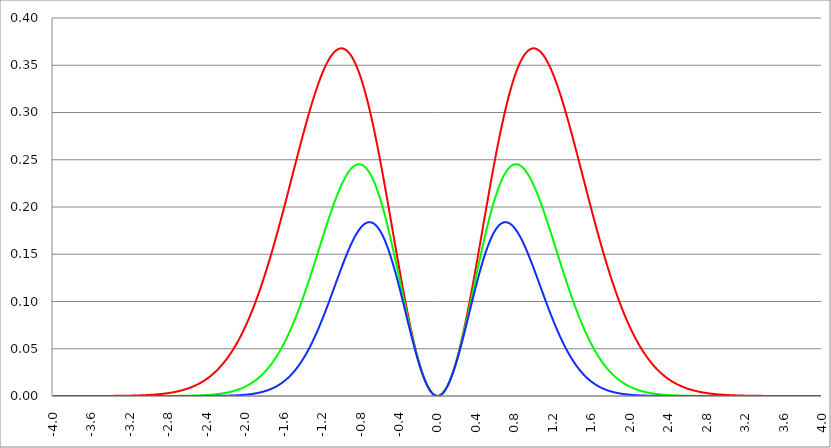
| Category | Series 1 | Series 0 | Series 2 |
|---|---|---|---|
| -4.0 | 0 | 0 | 0 |
| -3.996 | 0 | 0 | 0 |
| -3.992 | 0 | 0 | 0 |
| -3.988 | 0 | 0 | 0 |
| -3.984 | 0 | 0 | 0 |
| -3.98 | 0 | 0 | 0 |
| -3.976 | 0 | 0 | 0 |
| -3.972 | 0 | 0 | 0 |
| -3.968 | 0 | 0 | 0 |
| -3.964 | 0 | 0 | 0 |
| -3.96 | 0 | 0 | 0 |
| -3.956 | 0 | 0 | 0 |
| -3.952 | 0 | 0 | 0 |
| -3.948 | 0 | 0 | 0 |
| -3.944 | 0 | 0 | 0 |
| -3.94 | 0 | 0 | 0 |
| -3.936 | 0 | 0 | 0 |
| -3.932 | 0 | 0 | 0 |
| -3.928 | 0 | 0 | 0 |
| -3.924 | 0 | 0 | 0 |
| -3.92 | 0 | 0 | 0 |
| -3.916 | 0 | 0 | 0 |
| -3.912 | 0 | 0 | 0 |
| -3.908 | 0 | 0 | 0 |
| -3.904 | 0 | 0 | 0 |
| -3.9 | 0 | 0 | 0 |
| -3.896 | 0 | 0 | 0 |
| -3.892 | 0 | 0 | 0 |
| -3.888 | 0 | 0 | 0 |
| -3.884 | 0 | 0 | 0 |
| -3.88 | 0 | 0 | 0 |
| -3.876 | 0 | 0 | 0 |
| -3.872 | 0 | 0 | 0 |
| -3.868 | 0 | 0 | 0 |
| -3.864 | 0 | 0 | 0 |
| -3.86 | 0 | 0 | 0 |
| -3.856 | 0 | 0 | 0 |
| -3.852 | 0 | 0 | 0 |
| -3.848 | 0 | 0 | 0 |
| -3.844 | 0 | 0 | 0 |
| -3.84 | 0 | 0 | 0 |
| -3.836 | 0 | 0 | 0 |
| -3.832 | 0 | 0 | 0 |
| -3.828 | 0 | 0 | 0 |
| -3.824 | 0 | 0 | 0 |
| -3.82 | 0 | 0 | 0 |
| -3.816 | 0 | 0 | 0 |
| -3.812 | 0 | 0 | 0 |
| -3.808 | 0 | 0 | 0 |
| -3.804 | 0 | 0 | 0 |
| -3.8 | 0 | 0 | 0 |
| -3.796 | 0 | 0 | 0 |
| -3.792 | 0 | 0 | 0 |
| -3.788 | 0 | 0 | 0 |
| -3.784 | 0 | 0 | 0 |
| -3.78 | 0 | 0 | 0 |
| -3.776 | 0 | 0 | 0 |
| -3.772 | 0 | 0 | 0 |
| -3.768 | 0 | 0 | 0 |
| -3.764 | 0 | 0 | 0 |
| -3.76 | 0 | 0 | 0 |
| -3.756 | 0 | 0 | 0 |
| -3.752 | 0 | 0 | 0 |
| -3.748 | 0 | 0 | 0 |
| -3.744 | 0 | 0 | 0 |
| -3.74 | 0 | 0 | 0 |
| -3.736 | 0 | 0 | 0 |
| -3.732 | 0 | 0 | 0 |
| -3.728 | 0 | 0 | 0 |
| -3.724 | 0 | 0 | 0 |
| -3.72 | 0 | 0 | 0 |
| -3.716 | 0 | 0 | 0 |
| -3.712 | 0 | 0 | 0 |
| -3.708 | 0 | 0 | 0 |
| -3.704 | 0 | 0 | 0 |
| -3.7 | 0 | 0 | 0 |
| -3.696 | 0 | 0 | 0 |
| -3.692 | 0 | 0 | 0 |
| -3.688 | 0 | 0 | 0 |
| -3.684 | 0 | 0 | 0 |
| -3.68 | 0 | 0 | 0 |
| -3.676 | 0 | 0 | 0 |
| -3.672 | 0 | 0 | 0 |
| -3.668 | 0 | 0 | 0 |
| -3.664 | 0 | 0 | 0 |
| -3.66 | 0 | 0 | 0 |
| -3.656 | 0 | 0 | 0 |
| -3.652 | 0 | 0 | 0 |
| -3.648 | 0 | 0 | 0 |
| -3.644 | 0 | 0 | 0 |
| -3.64 | 0 | 0 | 0 |
| -3.636 | 0 | 0 | 0 |
| -3.632 | 0 | 0 | 0 |
| -3.628 | 0 | 0 | 0 |
| -3.624 | 0 | 0 | 0 |
| -3.62 | 0 | 0 | 0 |
| -3.616 | 0 | 0 | 0 |
| -3.612 | 0 | 0 | 0 |
| -3.608 | 0 | 0 | 0 |
| -3.604 | 0 | 0 | 0 |
| -3.6 | 0 | 0 | 0 |
| -3.596 | 0 | 0 | 0 |
| -3.592 | 0 | 0 | 0 |
| -3.588 | 0 | 0 | 0 |
| -3.584 | 0 | 0 | 0 |
| -3.58 | 0 | 0 | 0 |
| -3.576 | 0 | 0 | 0 |
| -3.572 | 0 | 0 | 0 |
| -3.568 | 0 | 0 | 0 |
| -3.564 | 0 | 0 | 0 |
| -3.56 | 0 | 0 | 0 |
| -3.556 | 0 | 0 | 0 |
| -3.552 | 0 | 0 | 0 |
| -3.548 | 0 | 0 | 0 |
| -3.544 | 0 | 0 | 0 |
| -3.54 | 0 | 0 | 0 |
| -3.536 | 0 | 0 | 0 |
| -3.532 | 0 | 0 | 0 |
| -3.528 | 0 | 0 | 0 |
| -3.524 | 0 | 0 | 0 |
| -3.52 | 0 | 0 | 0 |
| -3.516 | 0 | 0 | 0 |
| -3.512 | 0 | 0 | 0 |
| -3.508 | 0 | 0 | 0 |
| -3.504 | 0 | 0 | 0 |
| -3.5 | 0 | 0 | 0 |
| -3.496 | 0 | 0 | 0 |
| -3.492 | 0 | 0 | 0 |
| -3.488 | 0 | 0 | 0 |
| -3.484 | 0 | 0 | 0 |
| -3.48 | 0 | 0 | 0 |
| -3.476 | 0 | 0 | 0 |
| -3.472 | 0 | 0 | 0 |
| -3.467999999999999 | 0 | 0 | 0 |
| -3.463999999999999 | 0 | 0 | 0 |
| -3.459999999999999 | 0 | 0 | 0 |
| -3.455999999999999 | 0 | 0 | 0 |
| -3.451999999999999 | 0 | 0 | 0 |
| -3.447999999999999 | 0 | 0 | 0 |
| -3.443999999999999 | 0 | 0 | 0 |
| -3.439999999999999 | 0 | 0 | 0 |
| -3.435999999999999 | 0 | 0 | 0 |
| -3.431999999999999 | 0 | 0 | 0 |
| -3.427999999999999 | 0 | 0 | 0 |
| -3.423999999999999 | 0 | 0 | 0 |
| -3.419999999999999 | 0 | 0 | 0 |
| -3.415999999999999 | 0 | 0 | 0 |
| -3.411999999999999 | 0 | 0 | 0 |
| -3.407999999999999 | 0 | 0 | 0 |
| -3.403999999999999 | 0 | 0 | 0 |
| -3.399999999999999 | 0 | 0 | 0 |
| -3.395999999999999 | 0 | 0 | 0 |
| -3.391999999999999 | 0 | 0 | 0 |
| -3.387999999999999 | 0 | 0 | 0 |
| -3.383999999999999 | 0 | 0 | 0 |
| -3.379999999999999 | 0 | 0 | 0 |
| -3.375999999999999 | 0 | 0 | 0 |
| -3.371999999999999 | 0 | 0 | 0 |
| -3.367999999999999 | 0 | 0 | 0 |
| -3.363999999999999 | 0 | 0 | 0 |
| -3.359999999999999 | 0 | 0 | 0 |
| -3.355999999999999 | 0 | 0 | 0 |
| -3.351999999999999 | 0 | 0 | 0 |
| -3.347999999999999 | 0 | 0 | 0 |
| -3.343999999999999 | 0 | 0 | 0 |
| -3.339999999999999 | 0 | 0 | 0 |
| -3.335999999999999 | 0 | 0 | 0 |
| -3.331999999999999 | 0 | 0 | 0 |
| -3.327999999999999 | 0 | 0 | 0 |
| -3.323999999999999 | 0 | 0 | 0 |
| -3.319999999999999 | 0 | 0 | 0 |
| -3.315999999999999 | 0 | 0 | 0 |
| -3.311999999999999 | 0 | 0 | 0 |
| -3.307999999999999 | 0 | 0 | 0 |
| -3.303999999999999 | 0 | 0 | 0 |
| -3.299999999999999 | 0 | 0 | 0 |
| -3.295999999999999 | 0 | 0 | 0 |
| -3.291999999999999 | 0 | 0 | 0 |
| -3.288 | 0 | 0 | 0 |
| -3.284 | 0 | 0 | 0 |
| -3.279999999999999 | 0 | 0 | 0 |
| -3.275999999999999 | 0 | 0 | 0 |
| -3.271999999999999 | 0 | 0 | 0 |
| -3.268 | 0 | 0 | 0 |
| -3.264 | 0 | 0 | 0 |
| -3.259999999999999 | 0 | 0 | 0 |
| -3.255999999999999 | 0 | 0 | 0 |
| -3.251999999999999 | 0 | 0 | 0 |
| -3.248 | 0 | 0 | 0 |
| -3.244 | 0 | 0 | 0 |
| -3.239999999999999 | 0 | 0 | 0 |
| -3.235999999999999 | 0 | 0 | 0 |
| -3.231999999999999 | 0 | 0 | 0 |
| -3.228 | 0 | 0 | 0 |
| -3.224 | 0 | 0 | 0 |
| -3.219999999999999 | 0 | 0 | 0 |
| -3.215999999999999 | 0 | 0 | 0 |
| -3.211999999999999 | 0 | 0 | 0 |
| -3.208 | 0 | 0 | 0 |
| -3.204 | 0 | 0 | 0 |
| -3.199999999999999 | 0 | 0 | 0 |
| -3.195999999999999 | 0 | 0 | 0 |
| -3.191999999999999 | 0 | 0 | 0 |
| -3.188 | 0 | 0 | 0 |
| -3.184 | 0 | 0 | 0 |
| -3.179999999999999 | 0 | 0 | 0 |
| -3.175999999999999 | 0 | 0 | 0 |
| -3.171999999999999 | 0 | 0 | 0 |
| -3.168 | 0 | 0 | 0 |
| -3.164 | 0 | 0 | 0 |
| -3.159999999999999 | 0 | 0 | 0 |
| -3.155999999999999 | 0 | 0 | 0 |
| -3.151999999999999 | 0 | 0 | 0 |
| -3.148 | 0 | 0 | 0 |
| -3.144 | 0.001 | 0 | 0 |
| -3.139999999999999 | 0.001 | 0 | 0 |
| -3.135999999999999 | 0.001 | 0 | 0 |
| -3.131999999999999 | 0.001 | 0 | 0 |
| -3.128 | 0.001 | 0 | 0 |
| -3.124 | 0.001 | 0 | 0 |
| -3.119999999999999 | 0.001 | 0 | 0 |
| -3.115999999999999 | 0.001 | 0 | 0 |
| -3.111999999999999 | 0.001 | 0 | 0 |
| -3.108 | 0.001 | 0 | 0 |
| -3.104 | 0.001 | 0 | 0 |
| -3.099999999999999 | 0.001 | 0 | 0 |
| -3.095999999999999 | 0.001 | 0 | 0 |
| -3.091999999999999 | 0.001 | 0 | 0 |
| -3.088 | 0.001 | 0 | 0 |
| -3.084 | 0.001 | 0 | 0 |
| -3.079999999999999 | 0.001 | 0 | 0 |
| -3.075999999999999 | 0.001 | 0 | 0 |
| -3.071999999999999 | 0.001 | 0 | 0 |
| -3.068 | 0.001 | 0 | 0 |
| -3.064 | 0.001 | 0 | 0 |
| -3.059999999999999 | 0.001 | 0 | 0 |
| -3.055999999999999 | 0.001 | 0 | 0 |
| -3.051999999999999 | 0.001 | 0 | 0 |
| -3.048 | 0.001 | 0 | 0 |
| -3.044 | 0.001 | 0 | 0 |
| -3.039999999999999 | 0.001 | 0 | 0 |
| -3.035999999999999 | 0.001 | 0 | 0 |
| -3.031999999999999 | 0.001 | 0 | 0 |
| -3.028 | 0.001 | 0 | 0 |
| -3.024 | 0.001 | 0 | 0 |
| -3.019999999999999 | 0.001 | 0 | 0 |
| -3.015999999999999 | 0.001 | 0 | 0 |
| -3.011999999999999 | 0.001 | 0 | 0 |
| -3.008 | 0.001 | 0 | 0 |
| -3.004 | 0.001 | 0 | 0 |
| -2.999999999999999 | 0.001 | 0 | 0 |
| -2.995999999999999 | 0.001 | 0 | 0 |
| -2.991999999999999 | 0.001 | 0 | 0 |
| -2.988 | 0.001 | 0 | 0 |
| -2.984 | 0.001 | 0 | 0 |
| -2.979999999999999 | 0.001 | 0 | 0 |
| -2.975999999999999 | 0.001 | 0 | 0 |
| -2.971999999999999 | 0.001 | 0 | 0 |
| -2.968 | 0.001 | 0 | 0 |
| -2.964 | 0.001 | 0 | 0 |
| -2.959999999999999 | 0.001 | 0 | 0 |
| -2.955999999999999 | 0.001 | 0 | 0 |
| -2.951999999999999 | 0.001 | 0 | 0 |
| -2.948 | 0.001 | 0 | 0 |
| -2.944 | 0.001 | 0 | 0 |
| -2.939999999999999 | 0.002 | 0 | 0 |
| -2.935999999999999 | 0.002 | 0 | 0 |
| -2.931999999999999 | 0.002 | 0 | 0 |
| -2.928 | 0.002 | 0 | 0 |
| -2.924 | 0.002 | 0 | 0 |
| -2.919999999999999 | 0.002 | 0 | 0 |
| -2.915999999999999 | 0.002 | 0 | 0 |
| -2.911999999999999 | 0.002 | 0 | 0 |
| -2.908 | 0.002 | 0 | 0 |
| -2.904 | 0.002 | 0 | 0 |
| -2.899999999999999 | 0.002 | 0 | 0 |
| -2.895999999999999 | 0.002 | 0 | 0 |
| -2.891999999999999 | 0.002 | 0 | 0 |
| -2.887999999999999 | 0.002 | 0 | 0 |
| -2.883999999999999 | 0.002 | 0 | 0 |
| -2.879999999999999 | 0.002 | 0 | 0 |
| -2.875999999999999 | 0.002 | 0 | 0 |
| -2.871999999999999 | 0.002 | 0 | 0 |
| -2.867999999999999 | 0.002 | 0 | 0 |
| -2.863999999999999 | 0.002 | 0 | 0 |
| -2.859999999999999 | 0.002 | 0 | 0 |
| -2.855999999999999 | 0.002 | 0 | 0 |
| -2.851999999999999 | 0.002 | 0 | 0 |
| -2.847999999999999 | 0.002 | 0 | 0 |
| -2.843999999999999 | 0.002 | 0 | 0 |
| -2.839999999999999 | 0.003 | 0 | 0 |
| -2.835999999999999 | 0.003 | 0 | 0 |
| -2.831999999999999 | 0.003 | 0 | 0 |
| -2.827999999999999 | 0.003 | 0 | 0 |
| -2.823999999999999 | 0.003 | 0 | 0 |
| -2.819999999999999 | 0.003 | 0 | 0 |
| -2.815999999999999 | 0.003 | 0 | 0 |
| -2.811999999999999 | 0.003 | 0 | 0 |
| -2.807999999999999 | 0.003 | 0 | 0 |
| -2.803999999999999 | 0.003 | 0 | 0 |
| -2.799999999999999 | 0.003 | 0 | 0 |
| -2.795999999999999 | 0.003 | 0 | 0 |
| -2.791999999999999 | 0.003 | 0 | 0 |
| -2.787999999999999 | 0.003 | 0 | 0 |
| -2.783999999999999 | 0.003 | 0 | 0 |
| -2.779999999999999 | 0.003 | 0 | 0 |
| -2.775999999999999 | 0.003 | 0 | 0 |
| -2.771999999999999 | 0.004 | 0 | 0 |
| -2.767999999999999 | 0.004 | 0 | 0 |
| -2.763999999999999 | 0.004 | 0 | 0 |
| -2.759999999999999 | 0.004 | 0 | 0 |
| -2.755999999999999 | 0.004 | 0 | 0 |
| -2.751999999999999 | 0.004 | 0 | 0 |
| -2.747999999999999 | 0.004 | 0 | 0 |
| -2.743999999999999 | 0.004 | 0 | 0 |
| -2.739999999999999 | 0.004 | 0 | 0 |
| -2.735999999999999 | 0.004 | 0 | 0 |
| -2.731999999999999 | 0.004 | 0 | 0 |
| -2.727999999999999 | 0.004 | 0 | 0 |
| -2.723999999999999 | 0.004 | 0 | 0 |
| -2.719999999999999 | 0.005 | 0 | 0 |
| -2.715999999999999 | 0.005 | 0 | 0 |
| -2.711999999999999 | 0.005 | 0 | 0 |
| -2.707999999999999 | 0.005 | 0 | 0 |
| -2.703999999999999 | 0.005 | 0 | 0 |
| -2.699999999999999 | 0.005 | 0 | 0 |
| -2.695999999999999 | 0.005 | 0 | 0 |
| -2.691999999999999 | 0.005 | 0 | 0 |
| -2.687999999999999 | 0.005 | 0 | 0 |
| -2.683999999999999 | 0.005 | 0 | 0 |
| -2.679999999999999 | 0.005 | 0 | 0 |
| -2.675999999999999 | 0.006 | 0 | 0 |
| -2.671999999999999 | 0.006 | 0 | 0 |
| -2.667999999999999 | 0.006 | 0 | 0 |
| -2.663999999999999 | 0.006 | 0 | 0 |
| -2.659999999999999 | 0.006 | 0 | 0 |
| -2.655999999999999 | 0.006 | 0 | 0 |
| -2.651999999999999 | 0.006 | 0 | 0 |
| -2.647999999999999 | 0.006 | 0 | 0 |
| -2.643999999999999 | 0.006 | 0 | 0 |
| -2.639999999999999 | 0.007 | 0 | 0 |
| -2.635999999999999 | 0.007 | 0 | 0 |
| -2.631999999999999 | 0.007 | 0 | 0 |
| -2.627999999999999 | 0.007 | 0 | 0 |
| -2.623999999999999 | 0.007 | 0 | 0 |
| -2.619999999999999 | 0.007 | 0 | 0 |
| -2.615999999999999 | 0.007 | 0 | 0 |
| -2.611999999999999 | 0.007 | 0 | 0 |
| -2.607999999999999 | 0.008 | 0 | 0 |
| -2.603999999999999 | 0.008 | 0 | 0 |
| -2.599999999999999 | 0.008 | 0 | 0 |
| -2.595999999999999 | 0.008 | 0 | 0 |
| -2.591999999999999 | 0.008 | 0 | 0 |
| -2.587999999999999 | 0.008 | 0 | 0 |
| -2.583999999999999 | 0.008 | 0 | 0 |
| -2.579999999999999 | 0.009 | 0 | 0 |
| -2.575999999999999 | 0.009 | 0 | 0 |
| -2.571999999999999 | 0.009 | 0 | 0 |
| -2.567999999999999 | 0.009 | 0 | 0 |
| -2.563999999999999 | 0.009 | 0 | 0 |
| -2.559999999999999 | 0.009 | 0 | 0 |
| -2.555999999999999 | 0.01 | 0 | 0 |
| -2.551999999999999 | 0.01 | 0 | 0 |
| -2.547999999999999 | 0.01 | 0 | 0 |
| -2.543999999999999 | 0.01 | 0 | 0 |
| -2.539999999999999 | 0.01 | 0 | 0 |
| -2.535999999999999 | 0.01 | 0 | 0 |
| -2.531999999999999 | 0.011 | 0 | 0 |
| -2.527999999999999 | 0.011 | 0 | 0 |
| -2.523999999999999 | 0.011 | 0 | 0 |
| -2.519999999999999 | 0.011 | 0 | 0 |
| -2.515999999999999 | 0.011 | 0 | 0 |
| -2.511999999999999 | 0.011 | 0 | 0 |
| -2.507999999999999 | 0.012 | 0.001 | 0 |
| -2.503999999999999 | 0.012 | 0.001 | 0 |
| -2.499999999999999 | 0.012 | 0.001 | 0 |
| -2.495999999999999 | 0.012 | 0.001 | 0 |
| -2.491999999999999 | 0.012 | 0.001 | 0 |
| -2.487999999999999 | 0.013 | 0.001 | 0 |
| -2.483999999999999 | 0.013 | 0.001 | 0 |
| -2.479999999999999 | 0.013 | 0.001 | 0 |
| -2.475999999999999 | 0.013 | 0.001 | 0 |
| -2.471999999999999 | 0.014 | 0.001 | 0 |
| -2.467999999999999 | 0.014 | 0.001 | 0 |
| -2.463999999999999 | 0.014 | 0.001 | 0 |
| -2.459999999999999 | 0.014 | 0.001 | 0 |
| -2.455999999999999 | 0.014 | 0.001 | 0 |
| -2.451999999999999 | 0.015 | 0.001 | 0 |
| -2.447999999999999 | 0.015 | 0.001 | 0 |
| -2.443999999999999 | 0.015 | 0.001 | 0 |
| -2.439999999999999 | 0.015 | 0.001 | 0 |
| -2.435999999999999 | 0.016 | 0.001 | 0 |
| -2.431999999999999 | 0.016 | 0.001 | 0 |
| -2.427999999999999 | 0.016 | 0.001 | 0 |
| -2.423999999999999 | 0.016 | 0.001 | 0 |
| -2.419999999999999 | 0.017 | 0.001 | 0 |
| -2.415999999999999 | 0.017 | 0.001 | 0 |
| -2.411999999999999 | 0.017 | 0.001 | 0 |
| -2.407999999999999 | 0.018 | 0.001 | 0 |
| -2.403999999999999 | 0.018 | 0.001 | 0 |
| -2.399999999999999 | 0.018 | 0.001 | 0 |
| -2.395999999999999 | 0.018 | 0.001 | 0 |
| -2.391999999999999 | 0.019 | 0.001 | 0 |
| -2.387999999999999 | 0.019 | 0.001 | 0 |
| -2.383999999999999 | 0.019 | 0.001 | 0 |
| -2.379999999999999 | 0.02 | 0.001 | 0 |
| -2.375999999999999 | 0.02 | 0.001 | 0 |
| -2.371999999999999 | 0.02 | 0.001 | 0 |
| -2.367999999999998 | 0.021 | 0.001 | 0 |
| -2.363999999999998 | 0.021 | 0.001 | 0 |
| -2.359999999999998 | 0.021 | 0.001 | 0 |
| -2.355999999999998 | 0.022 | 0.001 | 0 |
| -2.351999999999998 | 0.022 | 0.001 | 0 |
| -2.347999999999998 | 0.022 | 0.001 | 0 |
| -2.343999999999998 | 0.023 | 0.001 | 0 |
| -2.339999999999998 | 0.023 | 0.001 | 0 |
| -2.335999999999998 | 0.023 | 0.002 | 0 |
| -2.331999999999998 | 0.024 | 0.002 | 0 |
| -2.327999999999998 | 0.024 | 0.002 | 0 |
| -2.323999999999998 | 0.024 | 0.002 | 0 |
| -2.319999999999998 | 0.025 | 0.002 | 0 |
| -2.315999999999998 | 0.025 | 0.002 | 0 |
| -2.311999999999998 | 0.025 | 0.002 | 0 |
| -2.307999999999998 | 0.026 | 0.002 | 0 |
| -2.303999999999998 | 0.026 | 0.002 | 0 |
| -2.299999999999998 | 0.027 | 0.002 | 0 |
| -2.295999999999998 | 0.027 | 0.002 | 0 |
| -2.291999999999998 | 0.027 | 0.002 | 0 |
| -2.287999999999998 | 0.028 | 0.002 | 0 |
| -2.283999999999998 | 0.028 | 0.002 | 0 |
| -2.279999999999998 | 0.029 | 0.002 | 0 |
| -2.275999999999998 | 0.029 | 0.002 | 0 |
| -2.271999999999998 | 0.03 | 0.002 | 0 |
| -2.267999999999998 | 0.03 | 0.002 | 0 |
| -2.263999999999998 | 0.03 | 0.002 | 0 |
| -2.259999999999998 | 0.031 | 0.002 | 0 |
| -2.255999999999998 | 0.031 | 0.002 | 0 |
| -2.251999999999998 | 0.032 | 0.003 | 0 |
| -2.247999999999998 | 0.032 | 0.003 | 0 |
| -2.243999999999998 | 0.033 | 0.003 | 0 |
| -2.239999999999998 | 0.033 | 0.003 | 0 |
| -2.235999999999998 | 0.034 | 0.003 | 0 |
| -2.231999999999998 | 0.034 | 0.003 | 0 |
| -2.227999999999998 | 0.035 | 0.003 | 0 |
| -2.223999999999998 | 0.035 | 0.003 | 0 |
| -2.219999999999998 | 0.036 | 0.003 | 0 |
| -2.215999999999998 | 0.036 | 0.003 | 0 |
| -2.211999999999998 | 0.037 | 0.003 | 0 |
| -2.207999999999998 | 0.037 | 0.003 | 0 |
| -2.203999999999998 | 0.038 | 0.003 | 0 |
| -2.199999999999998 | 0.038 | 0.003 | 0 |
| -2.195999999999998 | 0.039 | 0.003 | 0 |
| -2.191999999999998 | 0.039 | 0.004 | 0 |
| -2.187999999999998 | 0.04 | 0.004 | 0 |
| -2.183999999999998 | 0.04 | 0.004 | 0 |
| -2.179999999999998 | 0.041 | 0.004 | 0 |
| -2.175999999999998 | 0.042 | 0.004 | 0 |
| -2.171999999999998 | 0.042 | 0.004 | 0 |
| -2.167999999999998 | 0.043 | 0.004 | 0 |
| -2.163999999999998 | 0.043 | 0.004 | 0 |
| -2.159999999999998 | 0.044 | 0.004 | 0 |
| -2.155999999999998 | 0.045 | 0.004 | 0 |
| -2.151999999999998 | 0.045 | 0.004 | 0 |
| -2.147999999999998 | 0.046 | 0.005 | 0 |
| -2.143999999999998 | 0.046 | 0.005 | 0 |
| -2.139999999999998 | 0.047 | 0.005 | 0 |
| -2.135999999999998 | 0.048 | 0.005 | 0 |
| -2.131999999999998 | 0.048 | 0.005 | 0.001 |
| -2.127999999999998 | 0.049 | 0.005 | 0.001 |
| -2.123999999999998 | 0.05 | 0.005 | 0.001 |
| -2.119999999999998 | 0.05 | 0.005 | 0.001 |
| -2.115999999999998 | 0.051 | 0.005 | 0.001 |
| -2.111999999999998 | 0.052 | 0.006 | 0.001 |
| -2.107999999999998 | 0.052 | 0.006 | 0.001 |
| -2.103999999999998 | 0.053 | 0.006 | 0.001 |
| -2.099999999999998 | 0.054 | 0.006 | 0.001 |
| -2.095999999999998 | 0.054 | 0.006 | 0.001 |
| -2.091999999999998 | 0.055 | 0.006 | 0.001 |
| -2.087999999999998 | 0.056 | 0.006 | 0.001 |
| -2.083999999999998 | 0.056 | 0.006 | 0.001 |
| -2.079999999999998 | 0.057 | 0.007 | 0.001 |
| -2.075999999999998 | 0.058 | 0.007 | 0.001 |
| -2.071999999999998 | 0.059 | 0.007 | 0.001 |
| -2.067999999999998 | 0.059 | 0.007 | 0.001 |
| -2.063999999999998 | 0.06 | 0.007 | 0.001 |
| -2.059999999999998 | 0.061 | 0.007 | 0.001 |
| -2.055999999999998 | 0.062 | 0.007 | 0.001 |
| -2.051999999999998 | 0.062 | 0.008 | 0.001 |
| -2.047999999999998 | 0.063 | 0.008 | 0.001 |
| -2.043999999999998 | 0.064 | 0.008 | 0.001 |
| -2.039999999999998 | 0.065 | 0.008 | 0.001 |
| -2.035999999999998 | 0.066 | 0.008 | 0.001 |
| -2.031999999999998 | 0.066 | 0.008 | 0.001 |
| -2.027999999999998 | 0.067 | 0.009 | 0.001 |
| -2.023999999999998 | 0.068 | 0.009 | 0.001 |
| -2.019999999999998 | 0.069 | 0.009 | 0.001 |
| -2.015999999999998 | 0.07 | 0.009 | 0.001 |
| -2.011999999999998 | 0.071 | 0.009 | 0.001 |
| -2.007999999999998 | 0.072 | 0.01 | 0.001 |
| -2.003999999999998 | 0.072 | 0.01 | 0.001 |
| -1.999999999999998 | 0.073 | 0.01 | 0.001 |
| -1.995999999999998 | 0.074 | 0.01 | 0.001 |
| -1.991999999999998 | 0.075 | 0.01 | 0.001 |
| -1.987999999999998 | 0.076 | 0.011 | 0.001 |
| -1.983999999999998 | 0.077 | 0.011 | 0.002 |
| -1.979999999999998 | 0.078 | 0.011 | 0.002 |
| -1.975999999999998 | 0.079 | 0.011 | 0.002 |
| -1.971999999999998 | 0.08 | 0.011 | 0.002 |
| -1.967999999999998 | 0.081 | 0.012 | 0.002 |
| -1.963999999999998 | 0.081 | 0.012 | 0.002 |
| -1.959999999999998 | 0.082 | 0.012 | 0.002 |
| -1.955999999999998 | 0.083 | 0.012 | 0.002 |
| -1.951999999999998 | 0.084 | 0.013 | 0.002 |
| -1.947999999999998 | 0.085 | 0.013 | 0.002 |
| -1.943999999999998 | 0.086 | 0.013 | 0.002 |
| -1.939999999999998 | 0.087 | 0.013 | 0.002 |
| -1.935999999999998 | 0.088 | 0.014 | 0.002 |
| -1.931999999999998 | 0.089 | 0.014 | 0.002 |
| -1.927999999999998 | 0.09 | 0.014 | 0.002 |
| -1.923999999999998 | 0.091 | 0.014 | 0.002 |
| -1.919999999999998 | 0.092 | 0.015 | 0.002 |
| -1.915999999999998 | 0.093 | 0.015 | 0.002 |
| -1.911999999999998 | 0.094 | 0.015 | 0.002 |
| -1.907999999999998 | 0.096 | 0.015 | 0.003 |
| -1.903999999999998 | 0.097 | 0.016 | 0.003 |
| -1.899999999999998 | 0.098 | 0.016 | 0.003 |
| -1.895999999999998 | 0.099 | 0.016 | 0.003 |
| -1.891999999999998 | 0.1 | 0.017 | 0.003 |
| -1.887999999999998 | 0.101 | 0.017 | 0.003 |
| -1.883999999999998 | 0.102 | 0.017 | 0.003 |
| -1.879999999999998 | 0.103 | 0.018 | 0.003 |
| -1.875999999999998 | 0.104 | 0.018 | 0.003 |
| -1.871999999999998 | 0.105 | 0.018 | 0.003 |
| -1.867999999999998 | 0.106 | 0.019 | 0.003 |
| -1.863999999999998 | 0.108 | 0.019 | 0.003 |
| -1.859999999999998 | 0.109 | 0.019 | 0.003 |
| -1.855999999999998 | 0.11 | 0.02 | 0.004 |
| -1.851999999999998 | 0.111 | 0.02 | 0.004 |
| -1.847999999999998 | 0.112 | 0.02 | 0.004 |
| -1.843999999999998 | 0.113 | 0.021 | 0.004 |
| -1.839999999999998 | 0.115 | 0.021 | 0.004 |
| -1.835999999999998 | 0.116 | 0.021 | 0.004 |
| -1.831999999999998 | 0.117 | 0.022 | 0.004 |
| -1.827999999999998 | 0.118 | 0.022 | 0.004 |
| -1.823999999999998 | 0.119 | 0.023 | 0.004 |
| -1.819999999999998 | 0.121 | 0.023 | 0.004 |
| -1.815999999999998 | 0.122 | 0.023 | 0.005 |
| -1.811999999999998 | 0.123 | 0.024 | 0.005 |
| -1.807999999999998 | 0.124 | 0.024 | 0.005 |
| -1.803999999999998 | 0.126 | 0.025 | 0.005 |
| -1.799999999999998 | 0.127 | 0.025 | 0.005 |
| -1.795999999999998 | 0.128 | 0.026 | 0.005 |
| -1.791999999999998 | 0.129 | 0.026 | 0.005 |
| -1.787999999999998 | 0.131 | 0.026 | 0.005 |
| -1.783999999999998 | 0.132 | 0.027 | 0.005 |
| -1.779999999999998 | 0.133 | 0.027 | 0.006 |
| -1.775999999999998 | 0.135 | 0.028 | 0.006 |
| -1.771999999999998 | 0.136 | 0.028 | 0.006 |
| -1.767999999999998 | 0.137 | 0.029 | 0.006 |
| -1.763999999999998 | 0.139 | 0.029 | 0.006 |
| -1.759999999999998 | 0.14 | 0.03 | 0.006 |
| -1.755999999999998 | 0.141 | 0.03 | 0.006 |
| -1.751999999999998 | 0.143 | 0.031 | 0.007 |
| -1.747999999999998 | 0.144 | 0.031 | 0.007 |
| -1.743999999999998 | 0.145 | 0.032 | 0.007 |
| -1.739999999999998 | 0.147 | 0.032 | 0.007 |
| -1.735999999999998 | 0.148 | 0.033 | 0.007 |
| -1.731999999999998 | 0.149 | 0.033 | 0.007 |
| -1.727999999999998 | 0.151 | 0.034 | 0.008 |
| -1.723999999999998 | 0.152 | 0.034 | 0.008 |
| -1.719999999999998 | 0.154 | 0.035 | 0.008 |
| -1.715999999999998 | 0.155 | 0.036 | 0.008 |
| -1.711999999999998 | 0.156 | 0.036 | 0.008 |
| -1.707999999999998 | 0.158 | 0.037 | 0.009 |
| -1.703999999999998 | 0.159 | 0.037 | 0.009 |
| -1.699999999999998 | 0.161 | 0.038 | 0.009 |
| -1.695999999999998 | 0.162 | 0.038 | 0.009 |
| -1.691999999999998 | 0.163 | 0.039 | 0.009 |
| -1.687999999999998 | 0.165 | 0.04 | 0.01 |
| -1.683999999999998 | 0.166 | 0.04 | 0.01 |
| -1.679999999999998 | 0.168 | 0.041 | 0.01 |
| -1.675999999999998 | 0.169 | 0.042 | 0.01 |
| -1.671999999999998 | 0.171 | 0.042 | 0.01 |
| -1.667999999999998 | 0.172 | 0.043 | 0.011 |
| -1.663999999999998 | 0.174 | 0.044 | 0.011 |
| -1.659999999999998 | 0.175 | 0.044 | 0.011 |
| -1.655999999999998 | 0.177 | 0.045 | 0.011 |
| -1.651999999999998 | 0.178 | 0.046 | 0.012 |
| -1.647999999999998 | 0.18 | 0.046 | 0.012 |
| -1.643999999999998 | 0.181 | 0.047 | 0.012 |
| -1.639999999999998 | 0.183 | 0.048 | 0.012 |
| -1.635999999999998 | 0.184 | 0.048 | 0.013 |
| -1.631999999999998 | 0.186 | 0.049 | 0.013 |
| -1.627999999999998 | 0.187 | 0.05 | 0.013 |
| -1.623999999999998 | 0.189 | 0.05 | 0.014 |
| -1.619999999999998 | 0.19 | 0.051 | 0.014 |
| -1.615999999999998 | 0.192 | 0.052 | 0.014 |
| -1.611999999999998 | 0.193 | 0.053 | 0.014 |
| -1.607999999999998 | 0.195 | 0.053 | 0.015 |
| -1.603999999999998 | 0.196 | 0.054 | 0.015 |
| -1.599999999999998 | 0.198 | 0.055 | 0.015 |
| -1.595999999999998 | 0.199 | 0.056 | 0.016 |
| -1.591999999999998 | 0.201 | 0.057 | 0.016 |
| -1.587999999999998 | 0.203 | 0.057 | 0.016 |
| -1.583999999999998 | 0.204 | 0.058 | 0.017 |
| -1.579999999999998 | 0.206 | 0.059 | 0.017 |
| -1.575999999999998 | 0.207 | 0.06 | 0.017 |
| -1.571999999999998 | 0.209 | 0.061 | 0.018 |
| -1.567999999999998 | 0.21 | 0.062 | 0.018 |
| -1.563999999999998 | 0.212 | 0.062 | 0.018 |
| -1.559999999999998 | 0.213 | 0.063 | 0.019 |
| -1.555999999999998 | 0.215 | 0.064 | 0.019 |
| -1.551999999999998 | 0.217 | 0.065 | 0.019 |
| -1.547999999999998 | 0.218 | 0.066 | 0.02 |
| -1.543999999999998 | 0.22 | 0.067 | 0.02 |
| -1.539999999999998 | 0.221 | 0.068 | 0.021 |
| -1.535999999999998 | 0.223 | 0.069 | 0.021 |
| -1.531999999999998 | 0.225 | 0.069 | 0.021 |
| -1.527999999999998 | 0.226 | 0.07 | 0.022 |
| -1.523999999999998 | 0.228 | 0.071 | 0.022 |
| -1.519999999999998 | 0.229 | 0.072 | 0.023 |
| -1.515999999999998 | 0.231 | 0.073 | 0.023 |
| -1.511999999999998 | 0.232 | 0.074 | 0.024 |
| -1.507999999999998 | 0.234 | 0.075 | 0.024 |
| -1.503999999999998 | 0.236 | 0.076 | 0.025 |
| -1.499999999999998 | 0.237 | 0.077 | 0.025 |
| -1.495999999999998 | 0.239 | 0.078 | 0.025 |
| -1.491999999999998 | 0.24 | 0.079 | 0.026 |
| -1.487999999999998 | 0.242 | 0.08 | 0.026 |
| -1.483999999999998 | 0.243 | 0.081 | 0.027 |
| -1.479999999999998 | 0.245 | 0.082 | 0.027 |
| -1.475999999999998 | 0.247 | 0.083 | 0.028 |
| -1.471999999999998 | 0.248 | 0.084 | 0.028 |
| -1.467999999999998 | 0.25 | 0.085 | 0.029 |
| -1.463999999999998 | 0.251 | 0.086 | 0.029 |
| -1.459999999999998 | 0.253 | 0.087 | 0.03 |
| -1.455999999999998 | 0.254 | 0.088 | 0.031 |
| -1.451999999999998 | 0.256 | 0.089 | 0.031 |
| -1.447999999999998 | 0.258 | 0.09 | 0.032 |
| -1.443999999999998 | 0.259 | 0.091 | 0.032 |
| -1.439999999999998 | 0.261 | 0.092 | 0.033 |
| -1.435999999999998 | 0.262 | 0.094 | 0.033 |
| -1.431999999999998 | 0.264 | 0.095 | 0.034 |
| -1.427999999999998 | 0.265 | 0.096 | 0.035 |
| -1.423999999999998 | 0.267 | 0.097 | 0.035 |
| -1.419999999999998 | 0.268 | 0.098 | 0.036 |
| -1.415999999999998 | 0.27 | 0.099 | 0.036 |
| -1.411999999999998 | 0.272 | 0.1 | 0.037 |
| -1.407999999999998 | 0.273 | 0.101 | 0.038 |
| -1.403999999999998 | 0.275 | 0.102 | 0.038 |
| -1.399999999999998 | 0.276 | 0.104 | 0.039 |
| -1.395999999999998 | 0.278 | 0.105 | 0.04 |
| -1.391999999999998 | 0.279 | 0.106 | 0.04 |
| -1.387999999999998 | 0.281 | 0.107 | 0.041 |
| -1.383999999999998 | 0.282 | 0.108 | 0.042 |
| -1.379999999999998 | 0.284 | 0.109 | 0.042 |
| -1.375999999999998 | 0.285 | 0.111 | 0.043 |
| -1.371999999999998 | 0.287 | 0.112 | 0.044 |
| -1.367999999999998 | 0.288 | 0.113 | 0.044 |
| -1.363999999999998 | 0.289 | 0.114 | 0.045 |
| -1.359999999999998 | 0.291 | 0.115 | 0.046 |
| -1.355999999999998 | 0.292 | 0.117 | 0.046 |
| -1.351999999999998 | 0.294 | 0.118 | 0.047 |
| -1.347999999999998 | 0.295 | 0.119 | 0.048 |
| -1.343999999999998 | 0.297 | 0.12 | 0.049 |
| -1.339999999999998 | 0.298 | 0.121 | 0.049 |
| -1.335999999999998 | 0.3 | 0.123 | 0.05 |
| -1.331999999999998 | 0.301 | 0.124 | 0.051 |
| -1.327999999999998 | 0.302 | 0.125 | 0.052 |
| -1.323999999999998 | 0.304 | 0.126 | 0.053 |
| -1.319999999999998 | 0.305 | 0.128 | 0.053 |
| -1.315999999999998 | 0.306 | 0.129 | 0.054 |
| -1.311999999999998 | 0.308 | 0.13 | 0.055 |
| -1.307999999999998 | 0.309 | 0.131 | 0.056 |
| -1.303999999999998 | 0.311 | 0.133 | 0.057 |
| -1.299999999999998 | 0.312 | 0.134 | 0.058 |
| -1.295999999999998 | 0.313 | 0.135 | 0.058 |
| -1.291999999999998 | 0.314 | 0.136 | 0.059 |
| -1.287999999999998 | 0.316 | 0.138 | 0.06 |
| -1.283999999999998 | 0.317 | 0.139 | 0.061 |
| -1.279999999999998 | 0.318 | 0.14 | 0.062 |
| -1.275999999999998 | 0.32 | 0.142 | 0.063 |
| -1.271999999999998 | 0.321 | 0.143 | 0.064 |
| -1.267999999999998 | 0.322 | 0.144 | 0.065 |
| -1.263999999999998 | 0.323 | 0.145 | 0.065 |
| -1.259999999999998 | 0.325 | 0.147 | 0.066 |
| -1.255999999999998 | 0.326 | 0.148 | 0.067 |
| -1.251999999999998 | 0.327 | 0.149 | 0.068 |
| -1.247999999999998 | 0.328 | 0.151 | 0.069 |
| -1.243999999999998 | 0.329 | 0.152 | 0.07 |
| -1.239999999999998 | 0.33 | 0.153 | 0.071 |
| -1.235999999999998 | 0.332 | 0.154 | 0.072 |
| -1.231999999999998 | 0.333 | 0.156 | 0.073 |
| -1.227999999999998 | 0.334 | 0.157 | 0.074 |
| -1.223999999999998 | 0.335 | 0.158 | 0.075 |
| -1.219999999999998 | 0.336 | 0.16 | 0.076 |
| -1.215999999999998 | 0.337 | 0.161 | 0.077 |
| -1.211999999999998 | 0.338 | 0.162 | 0.078 |
| -1.207999999999998 | 0.339 | 0.163 | 0.079 |
| -1.203999999999998 | 0.34 | 0.165 | 0.08 |
| -1.199999999999997 | 0.341 | 0.166 | 0.081 |
| -1.195999999999997 | 0.342 | 0.167 | 0.082 |
| -1.191999999999997 | 0.343 | 0.169 | 0.083 |
| -1.187999999999997 | 0.344 | 0.17 | 0.084 |
| -1.183999999999997 | 0.345 | 0.171 | 0.085 |
| -1.179999999999997 | 0.346 | 0.172 | 0.086 |
| -1.175999999999997 | 0.347 | 0.174 | 0.087 |
| -1.171999999999997 | 0.348 | 0.175 | 0.088 |
| -1.167999999999997 | 0.349 | 0.176 | 0.089 |
| -1.163999999999997 | 0.35 | 0.178 | 0.09 |
| -1.159999999999997 | 0.35 | 0.179 | 0.091 |
| -1.155999999999997 | 0.351 | 0.18 | 0.092 |
| -1.151999999999997 | 0.352 | 0.181 | 0.093 |
| -1.147999999999997 | 0.353 | 0.183 | 0.094 |
| -1.143999999999997 | 0.354 | 0.184 | 0.096 |
| -1.139999999999997 | 0.354 | 0.185 | 0.097 |
| -1.135999999999997 | 0.355 | 0.186 | 0.098 |
| -1.131999999999997 | 0.356 | 0.187 | 0.099 |
| -1.127999999999997 | 0.356 | 0.189 | 0.1 |
| -1.123999999999997 | 0.357 | 0.19 | 0.101 |
| -1.119999999999997 | 0.358 | 0.191 | 0.102 |
| -1.115999999999997 | 0.358 | 0.192 | 0.103 |
| -1.111999999999997 | 0.359 | 0.193 | 0.104 |
| -1.107999999999997 | 0.36 | 0.195 | 0.105 |
| -1.103999999999997 | 0.36 | 0.196 | 0.106 |
| -1.099999999999997 | 0.361 | 0.197 | 0.108 |
| -1.095999999999997 | 0.361 | 0.198 | 0.109 |
| -1.091999999999997 | 0.362 | 0.199 | 0.11 |
| -1.087999999999997 | 0.362 | 0.201 | 0.111 |
| -1.083999999999997 | 0.363 | 0.202 | 0.112 |
| -1.079999999999997 | 0.363 | 0.203 | 0.113 |
| -1.075999999999997 | 0.364 | 0.204 | 0.114 |
| -1.071999999999997 | 0.364 | 0.205 | 0.115 |
| -1.067999999999997 | 0.365 | 0.206 | 0.117 |
| -1.063999999999997 | 0.365 | 0.207 | 0.118 |
| -1.059999999999997 | 0.365 | 0.208 | 0.119 |
| -1.055999999999997 | 0.366 | 0.209 | 0.12 |
| -1.051999999999997 | 0.366 | 0.21 | 0.121 |
| -1.047999999999997 | 0.366 | 0.211 | 0.122 |
| -1.043999999999997 | 0.366 | 0.213 | 0.123 |
| -1.039999999999997 | 0.367 | 0.214 | 0.124 |
| -1.035999999999997 | 0.367 | 0.215 | 0.125 |
| -1.031999999999997 | 0.367 | 0.216 | 0.127 |
| -1.027999999999997 | 0.367 | 0.217 | 0.128 |
| -1.023999999999997 | 0.367 | 0.218 | 0.129 |
| -1.019999999999997 | 0.368 | 0.218 | 0.13 |
| -1.015999999999997 | 0.368 | 0.219 | 0.131 |
| -1.011999999999997 | 0.368 | 0.22 | 0.132 |
| -1.007999999999997 | 0.368 | 0.221 | 0.133 |
| -1.003999999999997 | 0.368 | 0.222 | 0.134 |
| -0.999999999999997 | 0.368 | 0.223 | 0.135 |
| -0.995999999999997 | 0.368 | 0.224 | 0.136 |
| -0.991999999999997 | 0.368 | 0.225 | 0.137 |
| -0.987999999999997 | 0.368 | 0.226 | 0.139 |
| -0.983999999999997 | 0.368 | 0.227 | 0.14 |
| -0.979999999999997 | 0.368 | 0.227 | 0.141 |
| -0.975999999999997 | 0.367 | 0.228 | 0.142 |
| -0.971999999999997 | 0.367 | 0.229 | 0.143 |
| -0.967999999999997 | 0.367 | 0.23 | 0.144 |
| -0.963999999999997 | 0.367 | 0.231 | 0.145 |
| -0.959999999999997 | 0.367 | 0.231 | 0.146 |
| -0.955999999999997 | 0.366 | 0.232 | 0.147 |
| -0.951999999999997 | 0.366 | 0.233 | 0.148 |
| -0.947999999999997 | 0.366 | 0.233 | 0.149 |
| -0.943999999999997 | 0.366 | 0.234 | 0.15 |
| -0.939999999999997 | 0.365 | 0.235 | 0.151 |
| -0.935999999999997 | 0.365 | 0.235 | 0.152 |
| -0.931999999999997 | 0.364 | 0.236 | 0.153 |
| -0.927999999999997 | 0.364 | 0.237 | 0.154 |
| -0.923999999999997 | 0.364 | 0.237 | 0.155 |
| -0.919999999999997 | 0.363 | 0.238 | 0.156 |
| -0.915999999999997 | 0.363 | 0.238 | 0.157 |
| -0.911999999999997 | 0.362 | 0.239 | 0.158 |
| -0.907999999999997 | 0.362 | 0.239 | 0.159 |
| -0.903999999999997 | 0.361 | 0.24 | 0.159 |
| -0.899999999999997 | 0.36 | 0.24 | 0.16 |
| -0.895999999999997 | 0.36 | 0.241 | 0.161 |
| -0.891999999999997 | 0.359 | 0.241 | 0.162 |
| -0.887999999999997 | 0.358 | 0.242 | 0.163 |
| -0.883999999999997 | 0.358 | 0.242 | 0.164 |
| -0.879999999999997 | 0.357 | 0.242 | 0.165 |
| -0.875999999999997 | 0.356 | 0.243 | 0.165 |
| -0.871999999999997 | 0.355 | 0.243 | 0.166 |
| -0.867999999999997 | 0.355 | 0.243 | 0.167 |
| -0.863999999999997 | 0.354 | 0.244 | 0.168 |
| -0.859999999999997 | 0.353 | 0.244 | 0.168 |
| -0.855999999999997 | 0.352 | 0.244 | 0.169 |
| -0.851999999999997 | 0.351 | 0.244 | 0.17 |
| -0.847999999999997 | 0.35 | 0.245 | 0.171 |
| -0.843999999999997 | 0.349 | 0.245 | 0.171 |
| -0.839999999999997 | 0.348 | 0.245 | 0.172 |
| -0.835999999999997 | 0.347 | 0.245 | 0.173 |
| -0.831999999999997 | 0.346 | 0.245 | 0.173 |
| -0.827999999999997 | 0.345 | 0.245 | 0.174 |
| -0.823999999999997 | 0.344 | 0.245 | 0.175 |
| -0.819999999999997 | 0.343 | 0.245 | 0.175 |
| -0.815999999999997 | 0.342 | 0.245 | 0.176 |
| -0.811999999999997 | 0.341 | 0.245 | 0.176 |
| -0.807999999999997 | 0.34 | 0.245 | 0.177 |
| -0.803999999999997 | 0.339 | 0.245 | 0.177 |
| -0.799999999999997 | 0.337 | 0.245 | 0.178 |
| -0.795999999999997 | 0.336 | 0.245 | 0.178 |
| -0.791999999999997 | 0.335 | 0.245 | 0.179 |
| -0.787999999999997 | 0.334 | 0.245 | 0.179 |
| -0.783999999999997 | 0.332 | 0.244 | 0.18 |
| -0.779999999999997 | 0.331 | 0.244 | 0.18 |
| -0.775999999999997 | 0.33 | 0.244 | 0.181 |
| -0.771999999999997 | 0.328 | 0.244 | 0.181 |
| -0.767999999999997 | 0.327 | 0.243 | 0.181 |
| -0.763999999999997 | 0.326 | 0.243 | 0.182 |
| -0.759999999999997 | 0.324 | 0.243 | 0.182 |
| -0.755999999999997 | 0.323 | 0.243 | 0.182 |
| -0.751999999999997 | 0.321 | 0.242 | 0.182 |
| -0.747999999999997 | 0.32 | 0.242 | 0.183 |
| -0.743999999999997 | 0.318 | 0.241 | 0.183 |
| -0.739999999999997 | 0.317 | 0.241 | 0.183 |
| -0.735999999999997 | 0.315 | 0.24 | 0.183 |
| -0.731999999999997 | 0.314 | 0.24 | 0.183 |
| -0.727999999999997 | 0.312 | 0.239 | 0.184 |
| -0.723999999999997 | 0.31 | 0.239 | 0.184 |
| -0.719999999999997 | 0.309 | 0.238 | 0.184 |
| -0.715999999999997 | 0.307 | 0.238 | 0.184 |
| -0.711999999999997 | 0.305 | 0.237 | 0.184 |
| -0.707999999999997 | 0.304 | 0.236 | 0.184 |
| -0.703999999999997 | 0.302 | 0.236 | 0.184 |
| -0.699999999999997 | 0.3 | 0.235 | 0.184 |
| -0.695999999999997 | 0.298 | 0.234 | 0.184 |
| -0.691999999999997 | 0.297 | 0.233 | 0.184 |
| -0.687999999999997 | 0.295 | 0.233 | 0.184 |
| -0.683999999999997 | 0.293 | 0.232 | 0.184 |
| -0.679999999999997 | 0.291 | 0.231 | 0.183 |
| -0.675999999999997 | 0.289 | 0.23 | 0.183 |
| -0.671999999999997 | 0.287 | 0.229 | 0.183 |
| -0.667999999999997 | 0.286 | 0.228 | 0.183 |
| -0.663999999999997 | 0.284 | 0.228 | 0.183 |
| -0.659999999999997 | 0.282 | 0.227 | 0.182 |
| -0.655999999999997 | 0.28 | 0.226 | 0.182 |
| -0.651999999999997 | 0.278 | 0.225 | 0.182 |
| -0.647999999999997 | 0.276 | 0.224 | 0.181 |
| -0.643999999999997 | 0.274 | 0.223 | 0.181 |
| -0.639999999999997 | 0.272 | 0.222 | 0.181 |
| -0.635999999999997 | 0.27 | 0.221 | 0.18 |
| -0.631999999999997 | 0.268 | 0.219 | 0.18 |
| -0.627999999999997 | 0.266 | 0.218 | 0.179 |
| -0.623999999999997 | 0.264 | 0.217 | 0.179 |
| -0.619999999999997 | 0.262 | 0.216 | 0.178 |
| -0.615999999999997 | 0.26 | 0.215 | 0.178 |
| -0.611999999999997 | 0.258 | 0.214 | 0.177 |
| -0.607999999999997 | 0.255 | 0.212 | 0.176 |
| -0.603999999999997 | 0.253 | 0.211 | 0.176 |
| -0.599999999999997 | 0.251 | 0.21 | 0.175 |
| -0.595999999999997 | 0.249 | 0.208 | 0.175 |
| -0.591999999999997 | 0.247 | 0.207 | 0.174 |
| -0.587999999999997 | 0.245 | 0.206 | 0.173 |
| -0.583999999999997 | 0.242 | 0.204 | 0.172 |
| -0.579999999999997 | 0.24 | 0.203 | 0.172 |
| -0.575999999999997 | 0.238 | 0.202 | 0.171 |
| -0.571999999999997 | 0.236 | 0.2 | 0.17 |
| -0.567999999999997 | 0.234 | 0.199 | 0.169 |
| -0.563999999999997 | 0.231 | 0.197 | 0.168 |
| -0.559999999999997 | 0.229 | 0.196 | 0.167 |
| -0.555999999999997 | 0.227 | 0.194 | 0.167 |
| -0.551999999999997 | 0.225 | 0.193 | 0.166 |
| -0.547999999999997 | 0.222 | 0.191 | 0.165 |
| -0.543999999999997 | 0.22 | 0.19 | 0.164 |
| -0.539999999999997 | 0.218 | 0.188 | 0.163 |
| -0.535999999999997 | 0.216 | 0.187 | 0.162 |
| -0.531999999999997 | 0.213 | 0.185 | 0.161 |
| -0.527999999999997 | 0.211 | 0.184 | 0.16 |
| -0.523999999999997 | 0.209 | 0.182 | 0.159 |
| -0.519999999999997 | 0.206 | 0.18 | 0.157 |
| -0.515999999999997 | 0.204 | 0.179 | 0.156 |
| -0.511999999999997 | 0.202 | 0.177 | 0.155 |
| -0.507999999999997 | 0.199 | 0.175 | 0.154 |
| -0.503999999999997 | 0.197 | 0.174 | 0.153 |
| -0.499999999999997 | 0.195 | 0.172 | 0.152 |
| -0.495999999999997 | 0.192 | 0.17 | 0.15 |
| -0.491999999999997 | 0.19 | 0.168 | 0.149 |
| -0.487999999999997 | 0.188 | 0.167 | 0.148 |
| -0.483999999999997 | 0.185 | 0.165 | 0.147 |
| -0.479999999999997 | 0.183 | 0.163 | 0.145 |
| -0.475999999999997 | 0.181 | 0.161 | 0.144 |
| -0.471999999999997 | 0.178 | 0.159 | 0.143 |
| -0.467999999999997 | 0.176 | 0.158 | 0.141 |
| -0.463999999999997 | 0.174 | 0.156 | 0.14 |
| -0.459999999999997 | 0.171 | 0.154 | 0.139 |
| -0.455999999999997 | 0.169 | 0.152 | 0.137 |
| -0.451999999999997 | 0.167 | 0.15 | 0.136 |
| -0.447999999999997 | 0.164 | 0.149 | 0.134 |
| -0.443999999999997 | 0.162 | 0.147 | 0.133 |
| -0.439999999999997 | 0.16 | 0.145 | 0.131 |
| -0.435999999999997 | 0.157 | 0.143 | 0.13 |
| -0.431999999999997 | 0.155 | 0.141 | 0.128 |
| -0.427999999999997 | 0.153 | 0.139 | 0.127 |
| -0.423999999999997 | 0.15 | 0.137 | 0.125 |
| -0.419999999999997 | 0.148 | 0.135 | 0.124 |
| -0.415999999999997 | 0.146 | 0.133 | 0.122 |
| -0.411999999999997 | 0.143 | 0.132 | 0.121 |
| -0.407999999999997 | 0.141 | 0.13 | 0.119 |
| -0.403999999999997 | 0.139 | 0.128 | 0.118 |
| -0.399999999999997 | 0.136 | 0.126 | 0.116 |
| -0.395999999999997 | 0.134 | 0.124 | 0.115 |
| -0.391999999999997 | 0.132 | 0.122 | 0.113 |
| -0.387999999999997 | 0.13 | 0.12 | 0.111 |
| -0.383999999999997 | 0.127 | 0.118 | 0.11 |
| -0.379999999999997 | 0.125 | 0.116 | 0.108 |
| -0.375999999999997 | 0.123 | 0.114 | 0.107 |
| -0.371999999999997 | 0.12 | 0.112 | 0.105 |
| -0.367999999999997 | 0.118 | 0.111 | 0.103 |
| -0.363999999999997 | 0.116 | 0.109 | 0.102 |
| -0.359999999999997 | 0.114 | 0.107 | 0.1 |
| -0.355999999999997 | 0.112 | 0.105 | 0.098 |
| -0.351999999999997 | 0.109 | 0.103 | 0.097 |
| -0.347999999999997 | 0.107 | 0.101 | 0.095 |
| -0.343999999999997 | 0.105 | 0.099 | 0.093 |
| -0.339999999999997 | 0.103 | 0.097 | 0.092 |
| -0.335999999999997 | 0.101 | 0.095 | 0.09 |
| -0.331999999999997 | 0.099 | 0.093 | 0.088 |
| -0.327999999999997 | 0.097 | 0.092 | 0.087 |
| -0.323999999999997 | 0.095 | 0.09 | 0.085 |
| -0.319999999999997 | 0.092 | 0.088 | 0.083 |
| -0.315999999999997 | 0.09 | 0.086 | 0.082 |
| -0.311999999999997 | 0.088 | 0.084 | 0.08 |
| -0.307999999999997 | 0.086 | 0.082 | 0.078 |
| -0.303999999999997 | 0.084 | 0.08 | 0.077 |
| -0.299999999999997 | 0.082 | 0.079 | 0.075 |
| -0.295999999999997 | 0.08 | 0.077 | 0.074 |
| -0.291999999999997 | 0.078 | 0.075 | 0.072 |
| -0.287999999999997 | 0.076 | 0.073 | 0.07 |
| -0.283999999999997 | 0.074 | 0.071 | 0.069 |
| -0.279999999999997 | 0.072 | 0.07 | 0.067 |
| -0.275999999999997 | 0.071 | 0.068 | 0.065 |
| -0.271999999999997 | 0.069 | 0.066 | 0.064 |
| -0.267999999999997 | 0.067 | 0.064 | 0.062 |
| -0.263999999999997 | 0.065 | 0.063 | 0.061 |
| -0.259999999999997 | 0.063 | 0.061 | 0.059 |
| -0.255999999999997 | 0.061 | 0.059 | 0.057 |
| -0.251999999999997 | 0.06 | 0.058 | 0.056 |
| -0.247999999999997 | 0.058 | 0.056 | 0.054 |
| -0.243999999999997 | 0.056 | 0.054 | 0.053 |
| -0.239999999999997 | 0.054 | 0.053 | 0.051 |
| -0.235999999999997 | 0.053 | 0.051 | 0.05 |
| -0.231999999999997 | 0.051 | 0.05 | 0.048 |
| -0.227999999999997 | 0.049 | 0.048 | 0.047 |
| -0.223999999999997 | 0.048 | 0.047 | 0.045 |
| -0.219999999999997 | 0.046 | 0.045 | 0.044 |
| -0.215999999999997 | 0.045 | 0.044 | 0.042 |
| -0.211999999999997 | 0.043 | 0.042 | 0.041 |
| -0.207999999999997 | 0.041 | 0.041 | 0.04 |
| -0.203999999999997 | 0.04 | 0.039 | 0.038 |
| -0.199999999999997 | 0.038 | 0.038 | 0.037 |
| -0.195999999999997 | 0.037 | 0.036 | 0.036 |
| -0.191999999999997 | 0.036 | 0.035 | 0.034 |
| -0.187999999999997 | 0.034 | 0.034 | 0.033 |
| -0.183999999999997 | 0.033 | 0.032 | 0.032 |
| -0.179999999999997 | 0.031 | 0.031 | 0.03 |
| -0.175999999999997 | 0.03 | 0.03 | 0.029 |
| -0.171999999999997 | 0.029 | 0.028 | 0.028 |
| -0.167999999999997 | 0.027 | 0.027 | 0.027 |
| -0.163999999999997 | 0.026 | 0.026 | 0.025 |
| -0.159999999999997 | 0.025 | 0.025 | 0.024 |
| -0.155999999999997 | 0.024 | 0.023 | 0.023 |
| -0.151999999999997 | 0.023 | 0.022 | 0.022 |
| -0.147999999999997 | 0.021 | 0.021 | 0.021 |
| -0.143999999999997 | 0.02 | 0.02 | 0.02 |
| -0.139999999999997 | 0.019 | 0.019 | 0.019 |
| -0.135999999999997 | 0.018 | 0.018 | 0.018 |
| -0.131999999999997 | 0.017 | 0.017 | 0.017 |
| -0.127999999999997 | 0.016 | 0.016 | 0.016 |
| -0.123999999999997 | 0.015 | 0.015 | 0.015 |
| -0.119999999999997 | 0.014 | 0.014 | 0.014 |
| -0.115999999999997 | 0.013 | 0.013 | 0.013 |
| -0.111999999999997 | 0.012 | 0.012 | 0.012 |
| -0.107999999999997 | 0.012 | 0.011 | 0.011 |
| -0.103999999999997 | 0.011 | 0.011 | 0.011 |
| -0.0999999999999965 | 0.01 | 0.01 | 0.01 |
| -0.0959999999999965 | 0.009 | 0.009 | 0.009 |
| -0.0919999999999965 | 0.008 | 0.008 | 0.008 |
| -0.0879999999999965 | 0.008 | 0.008 | 0.008 |
| -0.0839999999999965 | 0.007 | 0.007 | 0.007 |
| -0.0799999999999965 | 0.006 | 0.006 | 0.006 |
| -0.0759999999999965 | 0.006 | 0.006 | 0.006 |
| -0.0719999999999965 | 0.005 | 0.005 | 0.005 |
| -0.0679999999999965 | 0.005 | 0.005 | 0.005 |
| -0.0639999999999965 | 0.004 | 0.004 | 0.004 |
| -0.0599999999999965 | 0.004 | 0.004 | 0.004 |
| -0.0559999999999965 | 0.003 | 0.003 | 0.003 |
| -0.0519999999999965 | 0.003 | 0.003 | 0.003 |
| -0.0479999999999965 | 0.002 | 0.002 | 0.002 |
| -0.0439999999999965 | 0.002 | 0.002 | 0.002 |
| -0.0399999999999965 | 0.002 | 0.002 | 0.002 |
| -0.0359999999999965 | 0.001 | 0.001 | 0.001 |
| -0.0319999999999965 | 0.001 | 0.001 | 0.001 |
| -0.0279999999999965 | 0.001 | 0.001 | 0.001 |
| -0.0239999999999965 | 0.001 | 0.001 | 0.001 |
| -0.0199999999999965 | 0 | 0 | 0 |
| -0.0159999999999965 | 0 | 0 | 0 |
| -0.0119999999999965 | 0 | 0 | 0 |
| -0.00799999999999647 | 0 | 0 | 0 |
| -0.00399999999999647 | 0 | 0 | 0 |
| 3.52495810318487e-15 | 0 | 0 | 0 |
| 0.00400000000000352 | 0 | 0 | 0 |
| 0.00800000000000352 | 0 | 0 | 0 |
| 0.0120000000000035 | 0 | 0 | 0 |
| 0.0160000000000035 | 0 | 0 | 0 |
| 0.0200000000000035 | 0 | 0 | 0 |
| 0.0240000000000035 | 0.001 | 0.001 | 0.001 |
| 0.0280000000000035 | 0.001 | 0.001 | 0.001 |
| 0.0320000000000035 | 0.001 | 0.001 | 0.001 |
| 0.0360000000000035 | 0.001 | 0.001 | 0.001 |
| 0.0400000000000035 | 0.002 | 0.002 | 0.002 |
| 0.0440000000000035 | 0.002 | 0.002 | 0.002 |
| 0.0480000000000035 | 0.002 | 0.002 | 0.002 |
| 0.0520000000000035 | 0.003 | 0.003 | 0.003 |
| 0.0560000000000035 | 0.003 | 0.003 | 0.003 |
| 0.0600000000000035 | 0.004 | 0.004 | 0.004 |
| 0.0640000000000035 | 0.004 | 0.004 | 0.004 |
| 0.0680000000000035 | 0.005 | 0.005 | 0.005 |
| 0.0720000000000036 | 0.005 | 0.005 | 0.005 |
| 0.0760000000000036 | 0.006 | 0.006 | 0.006 |
| 0.0800000000000036 | 0.006 | 0.006 | 0.006 |
| 0.0840000000000036 | 0.007 | 0.007 | 0.007 |
| 0.0880000000000036 | 0.008 | 0.008 | 0.008 |
| 0.0920000000000036 | 0.008 | 0.008 | 0.008 |
| 0.0960000000000036 | 0.009 | 0.009 | 0.009 |
| 0.100000000000004 | 0.01 | 0.01 | 0.01 |
| 0.104000000000004 | 0.011 | 0.011 | 0.011 |
| 0.108000000000004 | 0.012 | 0.011 | 0.011 |
| 0.112000000000004 | 0.012 | 0.012 | 0.012 |
| 0.116000000000004 | 0.013 | 0.013 | 0.013 |
| 0.120000000000004 | 0.014 | 0.014 | 0.014 |
| 0.124000000000004 | 0.015 | 0.015 | 0.015 |
| 0.128000000000004 | 0.016 | 0.016 | 0.016 |
| 0.132000000000004 | 0.017 | 0.017 | 0.017 |
| 0.136000000000004 | 0.018 | 0.018 | 0.018 |
| 0.140000000000004 | 0.019 | 0.019 | 0.019 |
| 0.144000000000004 | 0.02 | 0.02 | 0.02 |
| 0.148000000000004 | 0.021 | 0.021 | 0.021 |
| 0.152000000000004 | 0.023 | 0.022 | 0.022 |
| 0.156000000000004 | 0.024 | 0.023 | 0.023 |
| 0.160000000000004 | 0.025 | 0.025 | 0.024 |
| 0.164000000000004 | 0.026 | 0.026 | 0.025 |
| 0.168000000000004 | 0.027 | 0.027 | 0.027 |
| 0.172000000000004 | 0.029 | 0.028 | 0.028 |
| 0.176000000000004 | 0.03 | 0.03 | 0.029 |
| 0.180000000000004 | 0.031 | 0.031 | 0.03 |
| 0.184000000000004 | 0.033 | 0.032 | 0.032 |
| 0.188000000000004 | 0.034 | 0.034 | 0.033 |
| 0.192000000000004 | 0.036 | 0.035 | 0.034 |
| 0.196000000000004 | 0.037 | 0.036 | 0.036 |
| 0.200000000000004 | 0.038 | 0.038 | 0.037 |
| 0.204000000000004 | 0.04 | 0.039 | 0.038 |
| 0.208000000000004 | 0.041 | 0.041 | 0.04 |
| 0.212000000000004 | 0.043 | 0.042 | 0.041 |
| 0.216000000000004 | 0.045 | 0.044 | 0.042 |
| 0.220000000000004 | 0.046 | 0.045 | 0.044 |
| 0.224000000000004 | 0.048 | 0.047 | 0.045 |
| 0.228000000000004 | 0.049 | 0.048 | 0.047 |
| 0.232000000000004 | 0.051 | 0.05 | 0.048 |
| 0.236000000000004 | 0.053 | 0.051 | 0.05 |
| 0.240000000000004 | 0.054 | 0.053 | 0.051 |
| 0.244000000000004 | 0.056 | 0.054 | 0.053 |
| 0.248000000000004 | 0.058 | 0.056 | 0.054 |
| 0.252000000000004 | 0.06 | 0.058 | 0.056 |
| 0.256000000000004 | 0.061 | 0.059 | 0.057 |
| 0.260000000000004 | 0.063 | 0.061 | 0.059 |
| 0.264000000000004 | 0.065 | 0.063 | 0.061 |
| 0.268000000000004 | 0.067 | 0.064 | 0.062 |
| 0.272000000000004 | 0.069 | 0.066 | 0.064 |
| 0.276000000000004 | 0.071 | 0.068 | 0.065 |
| 0.280000000000004 | 0.072 | 0.07 | 0.067 |
| 0.284000000000004 | 0.074 | 0.071 | 0.069 |
| 0.288000000000004 | 0.076 | 0.073 | 0.07 |
| 0.292000000000004 | 0.078 | 0.075 | 0.072 |
| 0.296000000000004 | 0.08 | 0.077 | 0.074 |
| 0.300000000000004 | 0.082 | 0.079 | 0.075 |
| 0.304000000000004 | 0.084 | 0.08 | 0.077 |
| 0.308000000000004 | 0.086 | 0.082 | 0.078 |
| 0.312000000000004 | 0.088 | 0.084 | 0.08 |
| 0.316000000000004 | 0.09 | 0.086 | 0.082 |
| 0.320000000000004 | 0.092 | 0.088 | 0.083 |
| 0.324000000000004 | 0.095 | 0.09 | 0.085 |
| 0.328000000000004 | 0.097 | 0.092 | 0.087 |
| 0.332000000000004 | 0.099 | 0.093 | 0.088 |
| 0.336000000000004 | 0.101 | 0.095 | 0.09 |
| 0.340000000000004 | 0.103 | 0.097 | 0.092 |
| 0.344000000000004 | 0.105 | 0.099 | 0.093 |
| 0.348000000000004 | 0.107 | 0.101 | 0.095 |
| 0.352000000000004 | 0.109 | 0.103 | 0.097 |
| 0.356000000000004 | 0.112 | 0.105 | 0.098 |
| 0.360000000000004 | 0.114 | 0.107 | 0.1 |
| 0.364000000000004 | 0.116 | 0.109 | 0.102 |
| 0.368000000000004 | 0.118 | 0.111 | 0.103 |
| 0.372000000000004 | 0.12 | 0.112 | 0.105 |
| 0.376000000000004 | 0.123 | 0.114 | 0.107 |
| 0.380000000000004 | 0.125 | 0.116 | 0.108 |
| 0.384000000000004 | 0.127 | 0.118 | 0.11 |
| 0.388000000000004 | 0.13 | 0.12 | 0.111 |
| 0.392000000000004 | 0.132 | 0.122 | 0.113 |
| 0.396000000000004 | 0.134 | 0.124 | 0.115 |
| 0.400000000000004 | 0.136 | 0.126 | 0.116 |
| 0.404000000000004 | 0.139 | 0.128 | 0.118 |
| 0.408000000000004 | 0.141 | 0.13 | 0.119 |
| 0.412000000000004 | 0.143 | 0.132 | 0.121 |
| 0.416000000000004 | 0.146 | 0.133 | 0.122 |
| 0.420000000000004 | 0.148 | 0.135 | 0.124 |
| 0.424000000000004 | 0.15 | 0.137 | 0.125 |
| 0.428000000000004 | 0.153 | 0.139 | 0.127 |
| 0.432000000000004 | 0.155 | 0.141 | 0.128 |
| 0.436000000000004 | 0.157 | 0.143 | 0.13 |
| 0.440000000000004 | 0.16 | 0.145 | 0.131 |
| 0.444000000000004 | 0.162 | 0.147 | 0.133 |
| 0.448000000000004 | 0.164 | 0.149 | 0.134 |
| 0.452000000000004 | 0.167 | 0.15 | 0.136 |
| 0.456000000000004 | 0.169 | 0.152 | 0.137 |
| 0.460000000000004 | 0.171 | 0.154 | 0.139 |
| 0.464000000000004 | 0.174 | 0.156 | 0.14 |
| 0.468000000000004 | 0.176 | 0.158 | 0.141 |
| 0.472000000000004 | 0.178 | 0.159 | 0.143 |
| 0.476000000000004 | 0.181 | 0.161 | 0.144 |
| 0.480000000000004 | 0.183 | 0.163 | 0.145 |
| 0.484000000000004 | 0.185 | 0.165 | 0.147 |
| 0.488000000000004 | 0.188 | 0.167 | 0.148 |
| 0.492000000000004 | 0.19 | 0.168 | 0.149 |
| 0.496000000000004 | 0.192 | 0.17 | 0.15 |
| 0.500000000000004 | 0.195 | 0.172 | 0.152 |
| 0.504000000000004 | 0.197 | 0.174 | 0.153 |
| 0.508000000000004 | 0.199 | 0.175 | 0.154 |
| 0.512000000000004 | 0.202 | 0.177 | 0.155 |
| 0.516000000000004 | 0.204 | 0.179 | 0.156 |
| 0.520000000000004 | 0.206 | 0.18 | 0.157 |
| 0.524000000000004 | 0.209 | 0.182 | 0.159 |
| 0.528000000000004 | 0.211 | 0.184 | 0.16 |
| 0.532000000000004 | 0.213 | 0.185 | 0.161 |
| 0.536000000000004 | 0.216 | 0.187 | 0.162 |
| 0.540000000000004 | 0.218 | 0.188 | 0.163 |
| 0.544000000000004 | 0.22 | 0.19 | 0.164 |
| 0.548000000000004 | 0.222 | 0.191 | 0.165 |
| 0.552000000000004 | 0.225 | 0.193 | 0.166 |
| 0.556000000000004 | 0.227 | 0.194 | 0.167 |
| 0.560000000000004 | 0.229 | 0.196 | 0.167 |
| 0.564000000000004 | 0.231 | 0.197 | 0.168 |
| 0.568000000000004 | 0.234 | 0.199 | 0.169 |
| 0.572000000000004 | 0.236 | 0.2 | 0.17 |
| 0.576000000000004 | 0.238 | 0.202 | 0.171 |
| 0.580000000000004 | 0.24 | 0.203 | 0.172 |
| 0.584000000000004 | 0.242 | 0.204 | 0.172 |
| 0.588000000000004 | 0.245 | 0.206 | 0.173 |
| 0.592000000000004 | 0.247 | 0.207 | 0.174 |
| 0.596000000000004 | 0.249 | 0.208 | 0.175 |
| 0.600000000000004 | 0.251 | 0.21 | 0.175 |
| 0.604000000000004 | 0.253 | 0.211 | 0.176 |
| 0.608000000000004 | 0.255 | 0.212 | 0.176 |
| 0.612000000000004 | 0.258 | 0.214 | 0.177 |
| 0.616000000000004 | 0.26 | 0.215 | 0.178 |
| 0.620000000000004 | 0.262 | 0.216 | 0.178 |
| 0.624000000000004 | 0.264 | 0.217 | 0.179 |
| 0.628000000000004 | 0.266 | 0.218 | 0.179 |
| 0.632000000000004 | 0.268 | 0.219 | 0.18 |
| 0.636000000000004 | 0.27 | 0.221 | 0.18 |
| 0.640000000000004 | 0.272 | 0.222 | 0.181 |
| 0.644000000000004 | 0.274 | 0.223 | 0.181 |
| 0.648000000000004 | 0.276 | 0.224 | 0.181 |
| 0.652000000000004 | 0.278 | 0.225 | 0.182 |
| 0.656000000000004 | 0.28 | 0.226 | 0.182 |
| 0.660000000000004 | 0.282 | 0.227 | 0.182 |
| 0.664000000000004 | 0.284 | 0.228 | 0.183 |
| 0.668000000000004 | 0.286 | 0.228 | 0.183 |
| 0.672000000000004 | 0.287 | 0.229 | 0.183 |
| 0.676000000000004 | 0.289 | 0.23 | 0.183 |
| 0.680000000000004 | 0.291 | 0.231 | 0.183 |
| 0.684000000000004 | 0.293 | 0.232 | 0.184 |
| 0.688000000000004 | 0.295 | 0.233 | 0.184 |
| 0.692000000000004 | 0.297 | 0.233 | 0.184 |
| 0.696000000000004 | 0.298 | 0.234 | 0.184 |
| 0.700000000000004 | 0.3 | 0.235 | 0.184 |
| 0.704000000000004 | 0.302 | 0.236 | 0.184 |
| 0.708000000000004 | 0.304 | 0.236 | 0.184 |
| 0.712000000000004 | 0.305 | 0.237 | 0.184 |
| 0.716000000000004 | 0.307 | 0.238 | 0.184 |
| 0.720000000000004 | 0.309 | 0.238 | 0.184 |
| 0.724000000000004 | 0.31 | 0.239 | 0.184 |
| 0.728000000000004 | 0.312 | 0.239 | 0.184 |
| 0.732000000000004 | 0.314 | 0.24 | 0.183 |
| 0.736000000000004 | 0.315 | 0.24 | 0.183 |
| 0.740000000000004 | 0.317 | 0.241 | 0.183 |
| 0.744000000000004 | 0.318 | 0.241 | 0.183 |
| 0.748000000000004 | 0.32 | 0.242 | 0.183 |
| 0.752000000000004 | 0.321 | 0.242 | 0.182 |
| 0.756000000000004 | 0.323 | 0.243 | 0.182 |
| 0.760000000000004 | 0.324 | 0.243 | 0.182 |
| 0.764000000000004 | 0.326 | 0.243 | 0.182 |
| 0.768000000000004 | 0.327 | 0.243 | 0.181 |
| 0.772000000000004 | 0.328 | 0.244 | 0.181 |
| 0.776000000000004 | 0.33 | 0.244 | 0.181 |
| 0.780000000000004 | 0.331 | 0.244 | 0.18 |
| 0.784000000000004 | 0.332 | 0.244 | 0.18 |
| 0.788000000000004 | 0.334 | 0.245 | 0.179 |
| 0.792000000000004 | 0.335 | 0.245 | 0.179 |
| 0.796000000000004 | 0.336 | 0.245 | 0.178 |
| 0.800000000000004 | 0.337 | 0.245 | 0.178 |
| 0.804000000000004 | 0.339 | 0.245 | 0.177 |
| 0.808000000000004 | 0.34 | 0.245 | 0.177 |
| 0.812000000000004 | 0.341 | 0.245 | 0.176 |
| 0.816000000000004 | 0.342 | 0.245 | 0.176 |
| 0.820000000000004 | 0.343 | 0.245 | 0.175 |
| 0.824000000000004 | 0.344 | 0.245 | 0.175 |
| 0.828000000000004 | 0.345 | 0.245 | 0.174 |
| 0.832000000000004 | 0.346 | 0.245 | 0.173 |
| 0.836000000000004 | 0.347 | 0.245 | 0.173 |
| 0.840000000000004 | 0.348 | 0.245 | 0.172 |
| 0.844000000000004 | 0.349 | 0.245 | 0.171 |
| 0.848000000000004 | 0.35 | 0.245 | 0.171 |
| 0.852000000000004 | 0.351 | 0.244 | 0.17 |
| 0.856000000000004 | 0.352 | 0.244 | 0.169 |
| 0.860000000000004 | 0.353 | 0.244 | 0.168 |
| 0.864000000000004 | 0.354 | 0.244 | 0.168 |
| 0.868000000000004 | 0.355 | 0.243 | 0.167 |
| 0.872000000000004 | 0.355 | 0.243 | 0.166 |
| 0.876000000000004 | 0.356 | 0.243 | 0.165 |
| 0.880000000000004 | 0.357 | 0.242 | 0.165 |
| 0.884000000000004 | 0.358 | 0.242 | 0.164 |
| 0.888000000000004 | 0.358 | 0.242 | 0.163 |
| 0.892000000000004 | 0.359 | 0.241 | 0.162 |
| 0.896000000000004 | 0.36 | 0.241 | 0.161 |
| 0.900000000000004 | 0.36 | 0.24 | 0.16 |
| 0.904000000000004 | 0.361 | 0.24 | 0.159 |
| 0.908000000000004 | 0.362 | 0.239 | 0.159 |
| 0.912000000000004 | 0.362 | 0.239 | 0.158 |
| 0.916000000000004 | 0.363 | 0.238 | 0.157 |
| 0.920000000000004 | 0.363 | 0.238 | 0.156 |
| 0.924000000000004 | 0.364 | 0.237 | 0.155 |
| 0.928000000000004 | 0.364 | 0.237 | 0.154 |
| 0.932000000000004 | 0.364 | 0.236 | 0.153 |
| 0.936000000000004 | 0.365 | 0.235 | 0.152 |
| 0.940000000000004 | 0.365 | 0.235 | 0.151 |
| 0.944000000000004 | 0.366 | 0.234 | 0.15 |
| 0.948000000000004 | 0.366 | 0.233 | 0.149 |
| 0.952000000000004 | 0.366 | 0.233 | 0.148 |
| 0.956000000000004 | 0.366 | 0.232 | 0.147 |
| 0.960000000000004 | 0.367 | 0.231 | 0.146 |
| 0.964000000000004 | 0.367 | 0.231 | 0.145 |
| 0.968000000000004 | 0.367 | 0.23 | 0.144 |
| 0.972000000000004 | 0.367 | 0.229 | 0.143 |
| 0.976000000000004 | 0.367 | 0.228 | 0.142 |
| 0.980000000000004 | 0.368 | 0.227 | 0.141 |
| 0.984000000000004 | 0.368 | 0.227 | 0.14 |
| 0.988000000000004 | 0.368 | 0.226 | 0.139 |
| 0.992000000000004 | 0.368 | 0.225 | 0.137 |
| 0.996000000000004 | 0.368 | 0.224 | 0.136 |
| 1.000000000000004 | 0.368 | 0.223 | 0.135 |
| 1.004000000000004 | 0.368 | 0.222 | 0.134 |
| 1.008000000000004 | 0.368 | 0.221 | 0.133 |
| 1.012000000000004 | 0.368 | 0.22 | 0.132 |
| 1.016000000000004 | 0.368 | 0.219 | 0.131 |
| 1.020000000000004 | 0.368 | 0.218 | 0.13 |
| 1.024000000000004 | 0.367 | 0.218 | 0.129 |
| 1.028000000000004 | 0.367 | 0.217 | 0.128 |
| 1.032000000000004 | 0.367 | 0.216 | 0.127 |
| 1.036000000000004 | 0.367 | 0.215 | 0.125 |
| 1.040000000000004 | 0.367 | 0.214 | 0.124 |
| 1.044000000000004 | 0.366 | 0.213 | 0.123 |
| 1.048000000000004 | 0.366 | 0.211 | 0.122 |
| 1.052000000000004 | 0.366 | 0.21 | 0.121 |
| 1.056000000000004 | 0.366 | 0.209 | 0.12 |
| 1.060000000000004 | 0.365 | 0.208 | 0.119 |
| 1.064000000000004 | 0.365 | 0.207 | 0.118 |
| 1.068000000000004 | 0.365 | 0.206 | 0.117 |
| 1.072000000000004 | 0.364 | 0.205 | 0.115 |
| 1.076000000000004 | 0.364 | 0.204 | 0.114 |
| 1.080000000000004 | 0.363 | 0.203 | 0.113 |
| 1.084000000000004 | 0.363 | 0.202 | 0.112 |
| 1.088000000000004 | 0.362 | 0.201 | 0.111 |
| 1.092000000000004 | 0.362 | 0.199 | 0.11 |
| 1.096000000000004 | 0.361 | 0.198 | 0.109 |
| 1.100000000000004 | 0.361 | 0.197 | 0.108 |
| 1.104000000000004 | 0.36 | 0.196 | 0.106 |
| 1.108000000000004 | 0.36 | 0.195 | 0.105 |
| 1.112000000000004 | 0.359 | 0.193 | 0.104 |
| 1.116000000000004 | 0.358 | 0.192 | 0.103 |
| 1.120000000000004 | 0.358 | 0.191 | 0.102 |
| 1.124000000000004 | 0.357 | 0.19 | 0.101 |
| 1.128000000000004 | 0.356 | 0.189 | 0.1 |
| 1.132000000000004 | 0.356 | 0.187 | 0.099 |
| 1.136000000000004 | 0.355 | 0.186 | 0.098 |
| 1.140000000000004 | 0.354 | 0.185 | 0.097 |
| 1.144000000000004 | 0.354 | 0.184 | 0.096 |
| 1.148000000000004 | 0.353 | 0.183 | 0.094 |
| 1.152000000000004 | 0.352 | 0.181 | 0.093 |
| 1.156000000000004 | 0.351 | 0.18 | 0.092 |
| 1.160000000000004 | 0.35 | 0.179 | 0.091 |
| 1.164000000000004 | 0.35 | 0.178 | 0.09 |
| 1.168000000000004 | 0.349 | 0.176 | 0.089 |
| 1.172000000000004 | 0.348 | 0.175 | 0.088 |
| 1.176000000000004 | 0.347 | 0.174 | 0.087 |
| 1.180000000000004 | 0.346 | 0.172 | 0.086 |
| 1.184000000000004 | 0.345 | 0.171 | 0.085 |
| 1.188000000000004 | 0.344 | 0.17 | 0.084 |
| 1.192000000000004 | 0.343 | 0.169 | 0.083 |
| 1.196000000000004 | 0.342 | 0.167 | 0.082 |
| 1.200000000000004 | 0.341 | 0.166 | 0.081 |
| 1.204000000000004 | 0.34 | 0.165 | 0.08 |
| 1.208000000000004 | 0.339 | 0.163 | 0.079 |
| 1.212000000000004 | 0.338 | 0.162 | 0.078 |
| 1.216000000000004 | 0.337 | 0.161 | 0.077 |
| 1.220000000000004 | 0.336 | 0.16 | 0.076 |
| 1.224000000000004 | 0.335 | 0.158 | 0.075 |
| 1.228000000000004 | 0.334 | 0.157 | 0.074 |
| 1.232000000000004 | 0.333 | 0.156 | 0.073 |
| 1.236000000000004 | 0.332 | 0.154 | 0.072 |
| 1.240000000000004 | 0.33 | 0.153 | 0.071 |
| 1.244000000000004 | 0.329 | 0.152 | 0.07 |
| 1.248000000000004 | 0.328 | 0.151 | 0.069 |
| 1.252000000000004 | 0.327 | 0.149 | 0.068 |
| 1.256000000000004 | 0.326 | 0.148 | 0.067 |
| 1.260000000000004 | 0.325 | 0.147 | 0.066 |
| 1.264000000000004 | 0.323 | 0.145 | 0.065 |
| 1.268000000000004 | 0.322 | 0.144 | 0.065 |
| 1.272000000000004 | 0.321 | 0.143 | 0.064 |
| 1.276000000000004 | 0.32 | 0.142 | 0.063 |
| 1.280000000000004 | 0.318 | 0.14 | 0.062 |
| 1.284000000000004 | 0.317 | 0.139 | 0.061 |
| 1.288000000000004 | 0.316 | 0.138 | 0.06 |
| 1.292000000000004 | 0.314 | 0.136 | 0.059 |
| 1.296000000000004 | 0.313 | 0.135 | 0.058 |
| 1.300000000000004 | 0.312 | 0.134 | 0.058 |
| 1.304000000000004 | 0.311 | 0.133 | 0.057 |
| 1.308000000000004 | 0.309 | 0.131 | 0.056 |
| 1.312000000000004 | 0.308 | 0.13 | 0.055 |
| 1.316000000000004 | 0.306 | 0.129 | 0.054 |
| 1.320000000000004 | 0.305 | 0.128 | 0.053 |
| 1.324000000000004 | 0.304 | 0.126 | 0.053 |
| 1.328000000000004 | 0.302 | 0.125 | 0.052 |
| 1.332000000000004 | 0.301 | 0.124 | 0.051 |
| 1.336000000000004 | 0.3 | 0.123 | 0.05 |
| 1.340000000000004 | 0.298 | 0.121 | 0.049 |
| 1.344000000000004 | 0.297 | 0.12 | 0.049 |
| 1.348000000000004 | 0.295 | 0.119 | 0.048 |
| 1.352000000000004 | 0.294 | 0.118 | 0.047 |
| 1.356000000000004 | 0.292 | 0.117 | 0.046 |
| 1.360000000000004 | 0.291 | 0.115 | 0.046 |
| 1.364000000000004 | 0.289 | 0.114 | 0.045 |
| 1.368000000000004 | 0.288 | 0.113 | 0.044 |
| 1.372000000000004 | 0.287 | 0.112 | 0.044 |
| 1.376000000000004 | 0.285 | 0.111 | 0.043 |
| 1.380000000000004 | 0.284 | 0.109 | 0.042 |
| 1.384000000000004 | 0.282 | 0.108 | 0.042 |
| 1.388000000000005 | 0.281 | 0.107 | 0.041 |
| 1.392000000000004 | 0.279 | 0.106 | 0.04 |
| 1.396000000000004 | 0.278 | 0.105 | 0.04 |
| 1.400000000000005 | 0.276 | 0.104 | 0.039 |
| 1.404000000000005 | 0.275 | 0.102 | 0.038 |
| 1.408000000000005 | 0.273 | 0.101 | 0.038 |
| 1.412000000000005 | 0.272 | 0.1 | 0.037 |
| 1.416000000000005 | 0.27 | 0.099 | 0.036 |
| 1.420000000000005 | 0.268 | 0.098 | 0.036 |
| 1.424000000000005 | 0.267 | 0.097 | 0.035 |
| 1.428000000000005 | 0.265 | 0.096 | 0.035 |
| 1.432000000000005 | 0.264 | 0.095 | 0.034 |
| 1.436000000000005 | 0.262 | 0.094 | 0.033 |
| 1.440000000000005 | 0.261 | 0.092 | 0.033 |
| 1.444000000000005 | 0.259 | 0.091 | 0.032 |
| 1.448000000000005 | 0.258 | 0.09 | 0.032 |
| 1.452000000000005 | 0.256 | 0.089 | 0.031 |
| 1.456000000000005 | 0.254 | 0.088 | 0.031 |
| 1.460000000000005 | 0.253 | 0.087 | 0.03 |
| 1.464000000000005 | 0.251 | 0.086 | 0.029 |
| 1.468000000000005 | 0.25 | 0.085 | 0.029 |
| 1.472000000000005 | 0.248 | 0.084 | 0.028 |
| 1.476000000000005 | 0.247 | 0.083 | 0.028 |
| 1.480000000000005 | 0.245 | 0.082 | 0.027 |
| 1.484000000000005 | 0.243 | 0.081 | 0.027 |
| 1.488000000000005 | 0.242 | 0.08 | 0.026 |
| 1.492000000000005 | 0.24 | 0.079 | 0.026 |
| 1.496000000000005 | 0.239 | 0.078 | 0.025 |
| 1.500000000000005 | 0.237 | 0.077 | 0.025 |
| 1.504000000000005 | 0.236 | 0.076 | 0.025 |
| 1.508000000000005 | 0.234 | 0.075 | 0.024 |
| 1.512000000000005 | 0.232 | 0.074 | 0.024 |
| 1.516000000000005 | 0.231 | 0.073 | 0.023 |
| 1.520000000000005 | 0.229 | 0.072 | 0.023 |
| 1.524000000000005 | 0.228 | 0.071 | 0.022 |
| 1.528000000000005 | 0.226 | 0.07 | 0.022 |
| 1.532000000000005 | 0.225 | 0.069 | 0.021 |
| 1.536000000000005 | 0.223 | 0.069 | 0.021 |
| 1.540000000000005 | 0.221 | 0.068 | 0.021 |
| 1.544000000000005 | 0.22 | 0.067 | 0.02 |
| 1.548000000000005 | 0.218 | 0.066 | 0.02 |
| 1.552000000000005 | 0.217 | 0.065 | 0.019 |
| 1.556000000000005 | 0.215 | 0.064 | 0.019 |
| 1.560000000000005 | 0.213 | 0.063 | 0.019 |
| 1.564000000000005 | 0.212 | 0.062 | 0.018 |
| 1.568000000000005 | 0.21 | 0.062 | 0.018 |
| 1.572000000000005 | 0.209 | 0.061 | 0.018 |
| 1.576000000000005 | 0.207 | 0.06 | 0.017 |
| 1.580000000000005 | 0.206 | 0.059 | 0.017 |
| 1.584000000000005 | 0.204 | 0.058 | 0.017 |
| 1.588000000000005 | 0.203 | 0.057 | 0.016 |
| 1.592000000000005 | 0.201 | 0.057 | 0.016 |
| 1.596000000000005 | 0.199 | 0.056 | 0.016 |
| 1.600000000000005 | 0.198 | 0.055 | 0.015 |
| 1.604000000000005 | 0.196 | 0.054 | 0.015 |
| 1.608000000000005 | 0.195 | 0.053 | 0.015 |
| 1.612000000000005 | 0.193 | 0.053 | 0.014 |
| 1.616000000000005 | 0.192 | 0.052 | 0.014 |
| 1.620000000000005 | 0.19 | 0.051 | 0.014 |
| 1.624000000000005 | 0.189 | 0.05 | 0.014 |
| 1.628000000000005 | 0.187 | 0.05 | 0.013 |
| 1.632000000000005 | 0.186 | 0.049 | 0.013 |
| 1.636000000000005 | 0.184 | 0.048 | 0.013 |
| 1.640000000000005 | 0.183 | 0.048 | 0.012 |
| 1.644000000000005 | 0.181 | 0.047 | 0.012 |
| 1.648000000000005 | 0.18 | 0.046 | 0.012 |
| 1.652000000000005 | 0.178 | 0.046 | 0.012 |
| 1.656000000000005 | 0.177 | 0.045 | 0.011 |
| 1.660000000000005 | 0.175 | 0.044 | 0.011 |
| 1.664000000000005 | 0.174 | 0.044 | 0.011 |
| 1.668000000000005 | 0.172 | 0.043 | 0.011 |
| 1.672000000000005 | 0.171 | 0.042 | 0.01 |
| 1.676000000000005 | 0.169 | 0.042 | 0.01 |
| 1.680000000000005 | 0.168 | 0.041 | 0.01 |
| 1.684000000000005 | 0.166 | 0.04 | 0.01 |
| 1.688000000000005 | 0.165 | 0.04 | 0.01 |
| 1.692000000000005 | 0.163 | 0.039 | 0.009 |
| 1.696000000000005 | 0.162 | 0.038 | 0.009 |
| 1.700000000000005 | 0.161 | 0.038 | 0.009 |
| 1.704000000000005 | 0.159 | 0.037 | 0.009 |
| 1.708000000000005 | 0.158 | 0.037 | 0.009 |
| 1.712000000000005 | 0.156 | 0.036 | 0.008 |
| 1.716000000000005 | 0.155 | 0.036 | 0.008 |
| 1.720000000000005 | 0.154 | 0.035 | 0.008 |
| 1.724000000000005 | 0.152 | 0.034 | 0.008 |
| 1.728000000000005 | 0.151 | 0.034 | 0.008 |
| 1.732000000000005 | 0.149 | 0.033 | 0.007 |
| 1.736000000000005 | 0.148 | 0.033 | 0.007 |
| 1.740000000000005 | 0.147 | 0.032 | 0.007 |
| 1.744000000000005 | 0.145 | 0.032 | 0.007 |
| 1.748000000000005 | 0.144 | 0.031 | 0.007 |
| 1.752000000000005 | 0.143 | 0.031 | 0.007 |
| 1.756000000000005 | 0.141 | 0.03 | 0.006 |
| 1.760000000000005 | 0.14 | 0.03 | 0.006 |
| 1.764000000000005 | 0.139 | 0.029 | 0.006 |
| 1.768000000000005 | 0.137 | 0.029 | 0.006 |
| 1.772000000000005 | 0.136 | 0.028 | 0.006 |
| 1.776000000000005 | 0.135 | 0.028 | 0.006 |
| 1.780000000000005 | 0.133 | 0.027 | 0.006 |
| 1.784000000000005 | 0.132 | 0.027 | 0.005 |
| 1.788000000000005 | 0.131 | 0.026 | 0.005 |
| 1.792000000000005 | 0.129 | 0.026 | 0.005 |
| 1.796000000000005 | 0.128 | 0.026 | 0.005 |
| 1.800000000000005 | 0.127 | 0.025 | 0.005 |
| 1.804000000000005 | 0.126 | 0.025 | 0.005 |
| 1.808000000000005 | 0.124 | 0.024 | 0.005 |
| 1.812000000000005 | 0.123 | 0.024 | 0.005 |
| 1.816000000000005 | 0.122 | 0.023 | 0.005 |
| 1.820000000000005 | 0.121 | 0.023 | 0.004 |
| 1.824000000000005 | 0.119 | 0.023 | 0.004 |
| 1.828000000000005 | 0.118 | 0.022 | 0.004 |
| 1.832000000000005 | 0.117 | 0.022 | 0.004 |
| 1.836000000000005 | 0.116 | 0.021 | 0.004 |
| 1.840000000000005 | 0.115 | 0.021 | 0.004 |
| 1.844000000000005 | 0.113 | 0.021 | 0.004 |
| 1.848000000000005 | 0.112 | 0.02 | 0.004 |
| 1.852000000000005 | 0.111 | 0.02 | 0.004 |
| 1.856000000000005 | 0.11 | 0.02 | 0.004 |
| 1.860000000000005 | 0.109 | 0.019 | 0.003 |
| 1.864000000000005 | 0.108 | 0.019 | 0.003 |
| 1.868000000000005 | 0.106 | 0.019 | 0.003 |
| 1.872000000000005 | 0.105 | 0.018 | 0.003 |
| 1.876000000000005 | 0.104 | 0.018 | 0.003 |
| 1.880000000000005 | 0.103 | 0.018 | 0.003 |
| 1.884000000000005 | 0.102 | 0.017 | 0.003 |
| 1.888000000000005 | 0.101 | 0.017 | 0.003 |
| 1.892000000000005 | 0.1 | 0.017 | 0.003 |
| 1.896000000000005 | 0.099 | 0.016 | 0.003 |
| 1.900000000000005 | 0.098 | 0.016 | 0.003 |
| 1.904000000000005 | 0.097 | 0.016 | 0.003 |
| 1.908000000000005 | 0.096 | 0.015 | 0.003 |
| 1.912000000000005 | 0.094 | 0.015 | 0.002 |
| 1.916000000000005 | 0.093 | 0.015 | 0.002 |
| 1.920000000000005 | 0.092 | 0.015 | 0.002 |
| 1.924000000000005 | 0.091 | 0.014 | 0.002 |
| 1.928000000000005 | 0.09 | 0.014 | 0.002 |
| 1.932000000000005 | 0.089 | 0.014 | 0.002 |
| 1.936000000000005 | 0.088 | 0.014 | 0.002 |
| 1.940000000000005 | 0.087 | 0.013 | 0.002 |
| 1.944000000000005 | 0.086 | 0.013 | 0.002 |
| 1.948000000000005 | 0.085 | 0.013 | 0.002 |
| 1.952000000000005 | 0.084 | 0.013 | 0.002 |
| 1.956000000000005 | 0.083 | 0.012 | 0.002 |
| 1.960000000000005 | 0.082 | 0.012 | 0.002 |
| 1.964000000000005 | 0.081 | 0.012 | 0.002 |
| 1.968000000000005 | 0.081 | 0.012 | 0.002 |
| 1.972000000000005 | 0.08 | 0.011 | 0.002 |
| 1.976000000000005 | 0.079 | 0.011 | 0.002 |
| 1.980000000000005 | 0.078 | 0.011 | 0.002 |
| 1.984000000000005 | 0.077 | 0.011 | 0.002 |
| 1.988000000000005 | 0.076 | 0.011 | 0.001 |
| 1.992000000000005 | 0.075 | 0.01 | 0.001 |
| 1.996000000000005 | 0.074 | 0.01 | 0.001 |
| 2.000000000000005 | 0.073 | 0.01 | 0.001 |
| 2.004000000000005 | 0.072 | 0.01 | 0.001 |
| 2.008000000000005 | 0.072 | 0.01 | 0.001 |
| 2.012000000000005 | 0.071 | 0.009 | 0.001 |
| 2.016000000000005 | 0.07 | 0.009 | 0.001 |
| 2.020000000000005 | 0.069 | 0.009 | 0.001 |
| 2.024000000000005 | 0.068 | 0.009 | 0.001 |
| 2.028000000000005 | 0.067 | 0.009 | 0.001 |
| 2.032000000000005 | 0.066 | 0.008 | 0.001 |
| 2.036000000000005 | 0.066 | 0.008 | 0.001 |
| 2.040000000000005 | 0.065 | 0.008 | 0.001 |
| 2.044000000000005 | 0.064 | 0.008 | 0.001 |
| 2.048000000000005 | 0.063 | 0.008 | 0.001 |
| 2.052000000000005 | 0.062 | 0.008 | 0.001 |
| 2.056000000000005 | 0.062 | 0.007 | 0.001 |
| 2.060000000000005 | 0.061 | 0.007 | 0.001 |
| 2.064000000000005 | 0.06 | 0.007 | 0.001 |
| 2.068000000000005 | 0.059 | 0.007 | 0.001 |
| 2.072000000000005 | 0.059 | 0.007 | 0.001 |
| 2.076000000000005 | 0.058 | 0.007 | 0.001 |
| 2.080000000000005 | 0.057 | 0.007 | 0.001 |
| 2.084000000000005 | 0.056 | 0.006 | 0.001 |
| 2.088000000000005 | 0.056 | 0.006 | 0.001 |
| 2.092000000000005 | 0.055 | 0.006 | 0.001 |
| 2.096000000000005 | 0.054 | 0.006 | 0.001 |
| 2.100000000000005 | 0.054 | 0.006 | 0.001 |
| 2.104000000000005 | 0.053 | 0.006 | 0.001 |
| 2.108000000000005 | 0.052 | 0.006 | 0.001 |
| 2.112000000000005 | 0.052 | 0.006 | 0.001 |
| 2.116000000000005 | 0.051 | 0.005 | 0.001 |
| 2.120000000000005 | 0.05 | 0.005 | 0.001 |
| 2.124000000000005 | 0.05 | 0.005 | 0.001 |
| 2.128000000000005 | 0.049 | 0.005 | 0.001 |
| 2.132000000000005 | 0.048 | 0.005 | 0.001 |
| 2.136000000000005 | 0.048 | 0.005 | 0 |
| 2.140000000000005 | 0.047 | 0.005 | 0 |
| 2.144000000000005 | 0.046 | 0.005 | 0 |
| 2.148000000000005 | 0.046 | 0.005 | 0 |
| 2.152000000000005 | 0.045 | 0.004 | 0 |
| 2.156000000000005 | 0.045 | 0.004 | 0 |
| 2.160000000000005 | 0.044 | 0.004 | 0 |
| 2.164000000000005 | 0.043 | 0.004 | 0 |
| 2.168000000000005 | 0.043 | 0.004 | 0 |
| 2.172000000000005 | 0.042 | 0.004 | 0 |
| 2.176000000000005 | 0.042 | 0.004 | 0 |
| 2.180000000000005 | 0.041 | 0.004 | 0 |
| 2.184000000000005 | 0.04 | 0.004 | 0 |
| 2.188000000000005 | 0.04 | 0.004 | 0 |
| 2.192000000000005 | 0.039 | 0.004 | 0 |
| 2.196000000000005 | 0.039 | 0.003 | 0 |
| 2.200000000000005 | 0.038 | 0.003 | 0 |
| 2.204000000000005 | 0.038 | 0.003 | 0 |
| 2.208000000000005 | 0.037 | 0.003 | 0 |
| 2.212000000000005 | 0.037 | 0.003 | 0 |
| 2.216000000000005 | 0.036 | 0.003 | 0 |
| 2.220000000000005 | 0.036 | 0.003 | 0 |
| 2.224000000000005 | 0.035 | 0.003 | 0 |
| 2.228000000000005 | 0.035 | 0.003 | 0 |
| 2.232000000000005 | 0.034 | 0.003 | 0 |
| 2.236000000000005 | 0.034 | 0.003 | 0 |
| 2.240000000000005 | 0.033 | 0.003 | 0 |
| 2.244000000000005 | 0.033 | 0.003 | 0 |
| 2.248000000000005 | 0.032 | 0.003 | 0 |
| 2.252000000000005 | 0.032 | 0.003 | 0 |
| 2.256000000000005 | 0.031 | 0.002 | 0 |
| 2.260000000000005 | 0.031 | 0.002 | 0 |
| 2.264000000000005 | 0.03 | 0.002 | 0 |
| 2.268000000000005 | 0.03 | 0.002 | 0 |
| 2.272000000000005 | 0.03 | 0.002 | 0 |
| 2.276000000000005 | 0.029 | 0.002 | 0 |
| 2.280000000000005 | 0.029 | 0.002 | 0 |
| 2.284000000000005 | 0.028 | 0.002 | 0 |
| 2.288000000000005 | 0.028 | 0.002 | 0 |
| 2.292000000000005 | 0.027 | 0.002 | 0 |
| 2.296000000000005 | 0.027 | 0.002 | 0 |
| 2.300000000000005 | 0.027 | 0.002 | 0 |
| 2.304000000000005 | 0.026 | 0.002 | 0 |
| 2.308000000000005 | 0.026 | 0.002 | 0 |
| 2.312000000000005 | 0.025 | 0.002 | 0 |
| 2.316000000000005 | 0.025 | 0.002 | 0 |
| 2.320000000000005 | 0.025 | 0.002 | 0 |
| 2.324000000000005 | 0.024 | 0.002 | 0 |
| 2.328000000000005 | 0.024 | 0.002 | 0 |
| 2.332000000000005 | 0.024 | 0.002 | 0 |
| 2.336000000000005 | 0.023 | 0.002 | 0 |
| 2.340000000000005 | 0.023 | 0.001 | 0 |
| 2.344000000000005 | 0.023 | 0.001 | 0 |
| 2.348000000000005 | 0.022 | 0.001 | 0 |
| 2.352000000000005 | 0.022 | 0.001 | 0 |
| 2.356000000000005 | 0.022 | 0.001 | 0 |
| 2.360000000000005 | 0.021 | 0.001 | 0 |
| 2.364000000000005 | 0.021 | 0.001 | 0 |
| 2.368000000000005 | 0.021 | 0.001 | 0 |
| 2.372000000000005 | 0.02 | 0.001 | 0 |
| 2.376000000000005 | 0.02 | 0.001 | 0 |
| 2.380000000000005 | 0.02 | 0.001 | 0 |
| 2.384000000000005 | 0.019 | 0.001 | 0 |
| 2.388000000000005 | 0.019 | 0.001 | 0 |
| 2.392000000000005 | 0.019 | 0.001 | 0 |
| 2.396000000000005 | 0.018 | 0.001 | 0 |
| 2.400000000000005 | 0.018 | 0.001 | 0 |
| 2.404000000000005 | 0.018 | 0.001 | 0 |
| 2.408000000000005 | 0.018 | 0.001 | 0 |
| 2.412000000000005 | 0.017 | 0.001 | 0 |
| 2.416000000000005 | 0.017 | 0.001 | 0 |
| 2.420000000000005 | 0.017 | 0.001 | 0 |
| 2.424000000000005 | 0.016 | 0.001 | 0 |
| 2.428000000000005 | 0.016 | 0.001 | 0 |
| 2.432000000000005 | 0.016 | 0.001 | 0 |
| 2.436000000000005 | 0.016 | 0.001 | 0 |
| 2.440000000000005 | 0.015 | 0.001 | 0 |
| 2.444000000000005 | 0.015 | 0.001 | 0 |
| 2.448000000000005 | 0.015 | 0.001 | 0 |
| 2.452000000000005 | 0.015 | 0.001 | 0 |
| 2.456000000000005 | 0.014 | 0.001 | 0 |
| 2.460000000000005 | 0.014 | 0.001 | 0 |
| 2.464000000000005 | 0.014 | 0.001 | 0 |
| 2.468000000000005 | 0.014 | 0.001 | 0 |
| 2.472000000000005 | 0.014 | 0.001 | 0 |
| 2.476000000000005 | 0.013 | 0.001 | 0 |
| 2.480000000000005 | 0.013 | 0.001 | 0 |
| 2.484000000000005 | 0.013 | 0.001 | 0 |
| 2.488000000000005 | 0.013 | 0.001 | 0 |
| 2.492000000000005 | 0.012 | 0.001 | 0 |
| 2.496000000000005 | 0.012 | 0.001 | 0 |
| 2.500000000000005 | 0.012 | 0.001 | 0 |
| 2.504000000000005 | 0.012 | 0.001 | 0 |
| 2.508000000000005 | 0.012 | 0.001 | 0 |
| 2.512000000000005 | 0.011 | 0 | 0 |
| 2.516000000000005 | 0.011 | 0 | 0 |
| 2.520000000000005 | 0.011 | 0 | 0 |
| 2.524000000000005 | 0.011 | 0 | 0 |
| 2.528000000000005 | 0.011 | 0 | 0 |
| 2.532000000000005 | 0.011 | 0 | 0 |
| 2.536000000000005 | 0.01 | 0 | 0 |
| 2.540000000000005 | 0.01 | 0 | 0 |
| 2.544000000000005 | 0.01 | 0 | 0 |
| 2.548000000000005 | 0.01 | 0 | 0 |
| 2.552000000000005 | 0.01 | 0 | 0 |
| 2.556000000000005 | 0.01 | 0 | 0 |
| 2.560000000000005 | 0.009 | 0 | 0 |
| 2.564000000000005 | 0.009 | 0 | 0 |
| 2.568000000000005 | 0.009 | 0 | 0 |
| 2.572000000000005 | 0.009 | 0 | 0 |
| 2.576000000000005 | 0.009 | 0 | 0 |
| 2.580000000000005 | 0.009 | 0 | 0 |
| 2.584000000000005 | 0.008 | 0 | 0 |
| 2.588000000000005 | 0.008 | 0 | 0 |
| 2.592000000000005 | 0.008 | 0 | 0 |
| 2.596000000000005 | 0.008 | 0 | 0 |
| 2.600000000000005 | 0.008 | 0 | 0 |
| 2.604000000000005 | 0.008 | 0 | 0 |
| 2.608000000000005 | 0.008 | 0 | 0 |
| 2.612000000000005 | 0.007 | 0 | 0 |
| 2.616000000000005 | 0.007 | 0 | 0 |
| 2.620000000000005 | 0.007 | 0 | 0 |
| 2.624000000000005 | 0.007 | 0 | 0 |
| 2.628000000000005 | 0.007 | 0 | 0 |
| 2.632000000000005 | 0.007 | 0 | 0 |
| 2.636000000000005 | 0.007 | 0 | 0 |
| 2.640000000000005 | 0.007 | 0 | 0 |
| 2.644000000000005 | 0.006 | 0 | 0 |
| 2.648000000000005 | 0.006 | 0 | 0 |
| 2.652000000000005 | 0.006 | 0 | 0 |
| 2.656000000000005 | 0.006 | 0 | 0 |
| 2.660000000000005 | 0.006 | 0 | 0 |
| 2.664000000000005 | 0.006 | 0 | 0 |
| 2.668000000000005 | 0.006 | 0 | 0 |
| 2.672000000000005 | 0.006 | 0 | 0 |
| 2.676000000000005 | 0.006 | 0 | 0 |
| 2.680000000000005 | 0.005 | 0 | 0 |
| 2.684000000000005 | 0.005 | 0 | 0 |
| 2.688000000000005 | 0.005 | 0 | 0 |
| 2.692000000000005 | 0.005 | 0 | 0 |
| 2.696000000000005 | 0.005 | 0 | 0 |
| 2.700000000000005 | 0.005 | 0 | 0 |
| 2.704000000000005 | 0.005 | 0 | 0 |
| 2.708000000000005 | 0.005 | 0 | 0 |
| 2.712000000000005 | 0.005 | 0 | 0 |
| 2.716000000000005 | 0.005 | 0 | 0 |
| 2.720000000000005 | 0.005 | 0 | 0 |
| 2.724000000000005 | 0.004 | 0 | 0 |
| 2.728000000000005 | 0.004 | 0 | 0 |
| 2.732000000000005 | 0.004 | 0 | 0 |
| 2.736000000000005 | 0.004 | 0 | 0 |
| 2.740000000000005 | 0.004 | 0 | 0 |
| 2.744000000000005 | 0.004 | 0 | 0 |
| 2.748000000000005 | 0.004 | 0 | 0 |
| 2.752000000000005 | 0.004 | 0 | 0 |
| 2.756000000000005 | 0.004 | 0 | 0 |
| 2.760000000000005 | 0.004 | 0 | 0 |
| 2.764000000000005 | 0.004 | 0 | 0 |
| 2.768000000000005 | 0.004 | 0 | 0 |
| 2.772000000000005 | 0.004 | 0 | 0 |
| 2.776000000000005 | 0.003 | 0 | 0 |
| 2.780000000000005 | 0.003 | 0 | 0 |
| 2.784000000000005 | 0.003 | 0 | 0 |
| 2.788000000000006 | 0.003 | 0 | 0 |
| 2.792000000000005 | 0.003 | 0 | 0 |
| 2.796000000000005 | 0.003 | 0 | 0 |
| 2.800000000000006 | 0.003 | 0 | 0 |
| 2.804000000000006 | 0.003 | 0 | 0 |
| 2.808000000000006 | 0.003 | 0 | 0 |
| 2.812000000000006 | 0.003 | 0 | 0 |
| 2.816000000000006 | 0.003 | 0 | 0 |
| 2.820000000000006 | 0.003 | 0 | 0 |
| 2.824000000000006 | 0.003 | 0 | 0 |
| 2.828000000000006 | 0.003 | 0 | 0 |
| 2.832000000000006 | 0.003 | 0 | 0 |
| 2.836000000000006 | 0.003 | 0 | 0 |
| 2.840000000000006 | 0.003 | 0 | 0 |
| 2.844000000000006 | 0.002 | 0 | 0 |
| 2.848000000000006 | 0.002 | 0 | 0 |
| 2.852000000000006 | 0.002 | 0 | 0 |
| 2.856000000000006 | 0.002 | 0 | 0 |
| 2.860000000000006 | 0.002 | 0 | 0 |
| 2.864000000000006 | 0.002 | 0 | 0 |
| 2.868000000000006 | 0.002 | 0 | 0 |
| 2.872000000000006 | 0.002 | 0 | 0 |
| 2.876000000000006 | 0.002 | 0 | 0 |
| 2.880000000000006 | 0.002 | 0 | 0 |
| 2.884000000000006 | 0.002 | 0 | 0 |
| 2.888000000000006 | 0.002 | 0 | 0 |
| 2.892000000000006 | 0.002 | 0 | 0 |
| 2.896000000000006 | 0.002 | 0 | 0 |
| 2.900000000000006 | 0.002 | 0 | 0 |
| 2.904000000000006 | 0.002 | 0 | 0 |
| 2.908000000000006 | 0.002 | 0 | 0 |
| 2.912000000000006 | 0.002 | 0 | 0 |
| 2.916000000000006 | 0.002 | 0 | 0 |
| 2.920000000000006 | 0.002 | 0 | 0 |
| 2.924000000000006 | 0.002 | 0 | 0 |
| 2.928000000000006 | 0.002 | 0 | 0 |
| 2.932000000000006 | 0.002 | 0 | 0 |
| 2.936000000000006 | 0.002 | 0 | 0 |
| 2.940000000000006 | 0.002 | 0 | 0 |
| 2.944000000000006 | 0.001 | 0 | 0 |
| 2.948000000000006 | 0.001 | 0 | 0 |
| 2.952000000000006 | 0.001 | 0 | 0 |
| 2.956000000000006 | 0.001 | 0 | 0 |
| 2.960000000000006 | 0.001 | 0 | 0 |
| 2.964000000000006 | 0.001 | 0 | 0 |
| 2.968000000000006 | 0.001 | 0 | 0 |
| 2.972000000000006 | 0.001 | 0 | 0 |
| 2.976000000000006 | 0.001 | 0 | 0 |
| 2.980000000000006 | 0.001 | 0 | 0 |
| 2.984000000000006 | 0.001 | 0 | 0 |
| 2.988000000000006 | 0.001 | 0 | 0 |
| 2.992000000000006 | 0.001 | 0 | 0 |
| 2.996000000000006 | 0.001 | 0 | 0 |
| 3.000000000000006 | 0.001 | 0 | 0 |
| 3.004000000000006 | 0.001 | 0 | 0 |
| 3.008000000000006 | 0.001 | 0 | 0 |
| 3.012000000000006 | 0.001 | 0 | 0 |
| 3.016000000000006 | 0.001 | 0 | 0 |
| 3.020000000000006 | 0.001 | 0 | 0 |
| 3.024000000000006 | 0.001 | 0 | 0 |
| 3.028000000000006 | 0.001 | 0 | 0 |
| 3.032000000000006 | 0.001 | 0 | 0 |
| 3.036000000000006 | 0.001 | 0 | 0 |
| 3.040000000000006 | 0.001 | 0 | 0 |
| 3.044000000000006 | 0.001 | 0 | 0 |
| 3.048000000000006 | 0.001 | 0 | 0 |
| 3.052000000000006 | 0.001 | 0 | 0 |
| 3.056000000000006 | 0.001 | 0 | 0 |
| 3.060000000000006 | 0.001 | 0 | 0 |
| 3.064000000000006 | 0.001 | 0 | 0 |
| 3.068000000000006 | 0.001 | 0 | 0 |
| 3.072000000000006 | 0.001 | 0 | 0 |
| 3.076000000000006 | 0.001 | 0 | 0 |
| 3.080000000000006 | 0.001 | 0 | 0 |
| 3.084000000000006 | 0.001 | 0 | 0 |
| 3.088000000000006 | 0.001 | 0 | 0 |
| 3.092000000000006 | 0.001 | 0 | 0 |
| 3.096000000000006 | 0.001 | 0 | 0 |
| 3.100000000000006 | 0.001 | 0 | 0 |
| 3.104000000000006 | 0.001 | 0 | 0 |
| 3.108000000000006 | 0.001 | 0 | 0 |
| 3.112000000000006 | 0.001 | 0 | 0 |
| 3.116000000000006 | 0.001 | 0 | 0 |
| 3.120000000000006 | 0.001 | 0 | 0 |
| 3.124000000000006 | 0.001 | 0 | 0 |
| 3.128000000000006 | 0.001 | 0 | 0 |
| 3.132000000000006 | 0.001 | 0 | 0 |
| 3.136000000000006 | 0.001 | 0 | 0 |
| 3.140000000000006 | 0.001 | 0 | 0 |
| 3.144000000000006 | 0.001 | 0 | 0 |
| 3.148000000000006 | 0 | 0 | 0 |
| 3.152000000000006 | 0 | 0 | 0 |
| 3.156000000000006 | 0 | 0 | 0 |
| 3.160000000000006 | 0 | 0 | 0 |
| 3.164000000000006 | 0 | 0 | 0 |
| 3.168000000000006 | 0 | 0 | 0 |
| 3.172000000000006 | 0 | 0 | 0 |
| 3.176000000000006 | 0 | 0 | 0 |
| 3.180000000000006 | 0 | 0 | 0 |
| 3.184000000000006 | 0 | 0 | 0 |
| 3.188000000000006 | 0 | 0 | 0 |
| 3.192000000000006 | 0 | 0 | 0 |
| 3.196000000000006 | 0 | 0 | 0 |
| 3.200000000000006 | 0 | 0 | 0 |
| 3.204000000000006 | 0 | 0 | 0 |
| 3.208000000000006 | 0 | 0 | 0 |
| 3.212000000000006 | 0 | 0 | 0 |
| 3.216000000000006 | 0 | 0 | 0 |
| 3.220000000000006 | 0 | 0 | 0 |
| 3.224000000000006 | 0 | 0 | 0 |
| 3.228000000000006 | 0 | 0 | 0 |
| 3.232000000000006 | 0 | 0 | 0 |
| 3.236000000000006 | 0 | 0 | 0 |
| 3.240000000000006 | 0 | 0 | 0 |
| 3.244000000000006 | 0 | 0 | 0 |
| 3.248000000000006 | 0 | 0 | 0 |
| 3.252000000000006 | 0 | 0 | 0 |
| 3.256000000000006 | 0 | 0 | 0 |
| 3.260000000000006 | 0 | 0 | 0 |
| 3.264000000000006 | 0 | 0 | 0 |
| 3.268000000000006 | 0 | 0 | 0 |
| 3.272000000000006 | 0 | 0 | 0 |
| 3.276000000000006 | 0 | 0 | 0 |
| 3.280000000000006 | 0 | 0 | 0 |
| 3.284000000000006 | 0 | 0 | 0 |
| 3.288000000000006 | 0 | 0 | 0 |
| 3.292000000000006 | 0 | 0 | 0 |
| 3.296000000000006 | 0 | 0 | 0 |
| 3.300000000000006 | 0 | 0 | 0 |
| 3.304000000000006 | 0 | 0 | 0 |
| 3.308000000000006 | 0 | 0 | 0 |
| 3.312000000000006 | 0 | 0 | 0 |
| 3.316000000000006 | 0 | 0 | 0 |
| 3.320000000000006 | 0 | 0 | 0 |
| 3.324000000000006 | 0 | 0 | 0 |
| 3.328000000000006 | 0 | 0 | 0 |
| 3.332000000000006 | 0 | 0 | 0 |
| 3.336000000000006 | 0 | 0 | 0 |
| 3.340000000000006 | 0 | 0 | 0 |
| 3.344000000000006 | 0 | 0 | 0 |
| 3.348000000000006 | 0 | 0 | 0 |
| 3.352000000000006 | 0 | 0 | 0 |
| 3.356000000000006 | 0 | 0 | 0 |
| 3.360000000000006 | 0 | 0 | 0 |
| 3.364000000000006 | 0 | 0 | 0 |
| 3.368000000000006 | 0 | 0 | 0 |
| 3.372000000000006 | 0 | 0 | 0 |
| 3.376000000000006 | 0 | 0 | 0 |
| 3.380000000000006 | 0 | 0 | 0 |
| 3.384000000000006 | 0 | 0 | 0 |
| 3.388000000000006 | 0 | 0 | 0 |
| 3.392000000000006 | 0 | 0 | 0 |
| 3.396000000000006 | 0 | 0 | 0 |
| 3.400000000000006 | 0 | 0 | 0 |
| 3.404000000000006 | 0 | 0 | 0 |
| 3.408000000000006 | 0 | 0 | 0 |
| 3.412000000000006 | 0 | 0 | 0 |
| 3.416000000000006 | 0 | 0 | 0 |
| 3.420000000000006 | 0 | 0 | 0 |
| 3.424000000000006 | 0 | 0 | 0 |
| 3.428000000000006 | 0 | 0 | 0 |
| 3.432000000000006 | 0 | 0 | 0 |
| 3.436000000000006 | 0 | 0 | 0 |
| 3.440000000000006 | 0 | 0 | 0 |
| 3.444000000000006 | 0 | 0 | 0 |
| 3.448000000000006 | 0 | 0 | 0 |
| 3.452000000000006 | 0 | 0 | 0 |
| 3.456000000000006 | 0 | 0 | 0 |
| 3.460000000000006 | 0 | 0 | 0 |
| 3.464000000000006 | 0 | 0 | 0 |
| 3.468000000000006 | 0 | 0 | 0 |
| 3.472000000000006 | 0 | 0 | 0 |
| 3.476000000000006 | 0 | 0 | 0 |
| 3.480000000000006 | 0 | 0 | 0 |
| 3.484000000000006 | 0 | 0 | 0 |
| 3.488000000000006 | 0 | 0 | 0 |
| 3.492000000000006 | 0 | 0 | 0 |
| 3.496000000000006 | 0 | 0 | 0 |
| 3.500000000000006 | 0 | 0 | 0 |
| 3.504000000000006 | 0 | 0 | 0 |
| 3.508000000000006 | 0 | 0 | 0 |
| 3.512000000000006 | 0 | 0 | 0 |
| 3.516000000000006 | 0 | 0 | 0 |
| 3.520000000000006 | 0 | 0 | 0 |
| 3.524000000000006 | 0 | 0 | 0 |
| 3.528000000000006 | 0 | 0 | 0 |
| 3.532000000000006 | 0 | 0 | 0 |
| 3.536000000000006 | 0 | 0 | 0 |
| 3.540000000000006 | 0 | 0 | 0 |
| 3.544000000000006 | 0 | 0 | 0 |
| 3.548000000000006 | 0 | 0 | 0 |
| 3.552000000000006 | 0 | 0 | 0 |
| 3.556000000000006 | 0 | 0 | 0 |
| 3.560000000000006 | 0 | 0 | 0 |
| 3.564000000000006 | 0 | 0 | 0 |
| 3.568000000000006 | 0 | 0 | 0 |
| 3.572000000000006 | 0 | 0 | 0 |
| 3.576000000000006 | 0 | 0 | 0 |
| 3.580000000000006 | 0 | 0 | 0 |
| 3.584000000000006 | 0 | 0 | 0 |
| 3.588000000000006 | 0 | 0 | 0 |
| 3.592000000000006 | 0 | 0 | 0 |
| 3.596000000000006 | 0 | 0 | 0 |
| 3.600000000000006 | 0 | 0 | 0 |
| 3.604000000000006 | 0 | 0 | 0 |
| 3.608000000000006 | 0 | 0 | 0 |
| 3.612000000000006 | 0 | 0 | 0 |
| 3.616000000000006 | 0 | 0 | 0 |
| 3.620000000000006 | 0 | 0 | 0 |
| 3.624000000000006 | 0 | 0 | 0 |
| 3.628000000000006 | 0 | 0 | 0 |
| 3.632000000000006 | 0 | 0 | 0 |
| 3.636000000000006 | 0 | 0 | 0 |
| 3.640000000000006 | 0 | 0 | 0 |
| 3.644000000000006 | 0 | 0 | 0 |
| 3.648000000000006 | 0 | 0 | 0 |
| 3.652000000000006 | 0 | 0 | 0 |
| 3.656000000000006 | 0 | 0 | 0 |
| 3.660000000000006 | 0 | 0 | 0 |
| 3.664000000000006 | 0 | 0 | 0 |
| 3.668000000000006 | 0 | 0 | 0 |
| 3.672000000000006 | 0 | 0 | 0 |
| 3.676000000000006 | 0 | 0 | 0 |
| 3.680000000000006 | 0 | 0 | 0 |
| 3.684000000000006 | 0 | 0 | 0 |
| 3.688000000000006 | 0 | 0 | 0 |
| 3.692000000000006 | 0 | 0 | 0 |
| 3.696000000000006 | 0 | 0 | 0 |
| 3.700000000000006 | 0 | 0 | 0 |
| 3.704000000000006 | 0 | 0 | 0 |
| 3.708000000000006 | 0 | 0 | 0 |
| 3.712000000000006 | 0 | 0 | 0 |
| 3.716000000000006 | 0 | 0 | 0 |
| 3.720000000000006 | 0 | 0 | 0 |
| 3.724000000000006 | 0 | 0 | 0 |
| 3.728000000000006 | 0 | 0 | 0 |
| 3.732000000000006 | 0 | 0 | 0 |
| 3.736000000000006 | 0 | 0 | 0 |
| 3.740000000000006 | 0 | 0 | 0 |
| 3.744000000000006 | 0 | 0 | 0 |
| 3.748000000000006 | 0 | 0 | 0 |
| 3.752000000000006 | 0 | 0 | 0 |
| 3.756000000000006 | 0 | 0 | 0 |
| 3.760000000000006 | 0 | 0 | 0 |
| 3.764000000000006 | 0 | 0 | 0 |
| 3.768000000000006 | 0 | 0 | 0 |
| 3.772000000000006 | 0 | 0 | 0 |
| 3.776000000000006 | 0 | 0 | 0 |
| 3.780000000000006 | 0 | 0 | 0 |
| 3.784000000000006 | 0 | 0 | 0 |
| 3.788000000000006 | 0 | 0 | 0 |
| 3.792000000000006 | 0 | 0 | 0 |
| 3.796000000000006 | 0 | 0 | 0 |
| 3.800000000000006 | 0 | 0 | 0 |
| 3.804000000000006 | 0 | 0 | 0 |
| 3.808000000000006 | 0 | 0 | 0 |
| 3.812000000000006 | 0 | 0 | 0 |
| 3.816000000000006 | 0 | 0 | 0 |
| 3.820000000000006 | 0 | 0 | 0 |
| 3.824000000000006 | 0 | 0 | 0 |
| 3.828000000000006 | 0 | 0 | 0 |
| 3.832000000000006 | 0 | 0 | 0 |
| 3.836000000000006 | 0 | 0 | 0 |
| 3.840000000000006 | 0 | 0 | 0 |
| 3.844000000000006 | 0 | 0 | 0 |
| 3.848000000000006 | 0 | 0 | 0 |
| 3.852000000000006 | 0 | 0 | 0 |
| 3.856000000000006 | 0 | 0 | 0 |
| 3.860000000000006 | 0 | 0 | 0 |
| 3.864000000000006 | 0 | 0 | 0 |
| 3.868000000000006 | 0 | 0 | 0 |
| 3.872000000000006 | 0 | 0 | 0 |
| 3.876000000000006 | 0 | 0 | 0 |
| 3.880000000000006 | 0 | 0 | 0 |
| 3.884000000000006 | 0 | 0 | 0 |
| 3.888000000000007 | 0 | 0 | 0 |
| 3.892000000000006 | 0 | 0 | 0 |
| 3.896000000000006 | 0 | 0 | 0 |
| 3.900000000000007 | 0 | 0 | 0 |
| 3.904000000000007 | 0 | 0 | 0 |
| 3.908000000000007 | 0 | 0 | 0 |
| 3.912000000000007 | 0 | 0 | 0 |
| 3.916000000000007 | 0 | 0 | 0 |
| 3.920000000000007 | 0 | 0 | 0 |
| 3.924000000000007 | 0 | 0 | 0 |
| 3.928000000000007 | 0 | 0 | 0 |
| 3.932000000000007 | 0 | 0 | 0 |
| 3.936000000000007 | 0 | 0 | 0 |
| 3.940000000000007 | 0 | 0 | 0 |
| 3.944000000000007 | 0 | 0 | 0 |
| 3.948000000000007 | 0 | 0 | 0 |
| 3.952000000000007 | 0 | 0 | 0 |
| 3.956000000000007 | 0 | 0 | 0 |
| 3.960000000000007 | 0 | 0 | 0 |
| 3.964000000000007 | 0 | 0 | 0 |
| 3.968000000000007 | 0 | 0 | 0 |
| 3.972000000000007 | 0 | 0 | 0 |
| 3.976000000000007 | 0 | 0 | 0 |
| 3.980000000000007 | 0 | 0 | 0 |
| 3.984000000000007 | 0 | 0 | 0 |
| 3.988000000000007 | 0 | 0 | 0 |
| 3.992000000000007 | 0 | 0 | 0 |
| 3.996000000000007 | 0 | 0 | 0 |
| 4.000000000000006 | 0 | 0 | 0 |